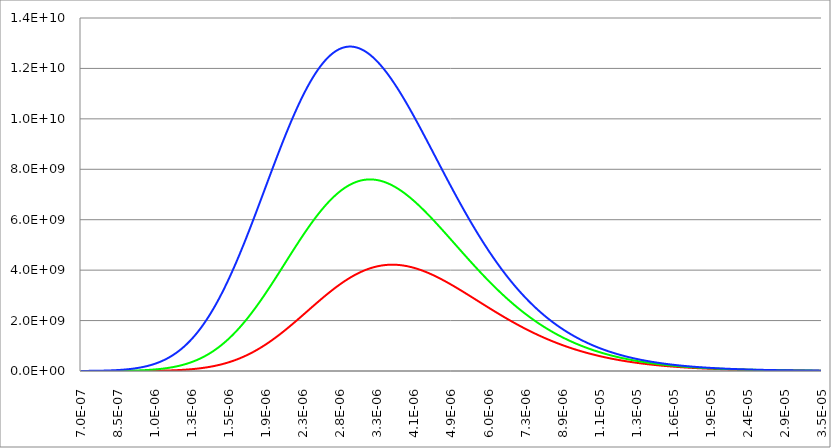
| Category | Series 1 | Series 0 | Series 2 |
|---|---|---|---|
| 7e-07 | 15470.366 | 268712.566 | 2637047.107 |
| 7.0137054801877e-07 | 16108.577 | 278241.494 | 2718401.957 |
| 7.02743779468786e-07 | 16771.471 | 288083.208 | 2802046.737 |
| 7.04119699604006e-07 | 17459.935 | 298247.075 | 2888039.017 |
| 7.05498313688677e-07 | 18174.883 | 308742.713 | 2976437.619 |
| 7.06879626997351e-07 | 18917.263 | 319579.997 | 3067302.632 |
| 7.08263644814909e-07 | 19688.049 | 330769.063 | 3160695.437 |
| 7.09650372436578e-07 | 20488.25 | 342320.314 | 3256678.73 |
| 7.11039815167953e-07 | 21318.908 | 354244.43 | 3355316.541 |
| 7.12431978325018e-07 | 22181.096 | 366552.37 | 3456674.26 |
| 7.13826867234164e-07 | 23075.925 | 379255.377 | 3560818.659 |
| 7.15224487232211e-07 | 24004.538 | 392364.991 | 3667817.914 |
| 7.16624843666428e-07 | 24968.118 | 405893.048 | 3777741.631 |
| 7.18027941894555e-07 | 25967.885 | 419851.694 | 3890660.867 |
| 7.1943378728482e-07 | 27005.096 | 434253.385 | 4006648.154 |
| 7.20842385215962e-07 | 28081.049 | 449110.897 | 4125777.527 |
| 7.22253741077253e-07 | 29197.084 | 464437.333 | 4248124.543 |
| 7.23667860268514e-07 | 30354.582 | 480246.131 | 4373766.309 |
| 7.25084748200141e-07 | 31554.967 | 496551.068 | 4502781.506 |
| 7.26504410293122e-07 | 32799.709 | 513366.272 | 4635250.416 |
| 7.27926851979058e-07 | 34090.324 | 530706.223 | 4771254.942 |
| 7.29352078700186e-07 | 35428.373 | 548585.77 | 4910878.641 |
| 7.30780095909398e-07 | 36815.467 | 567020.127 | 5054206.743 |
| 7.32210909070263e-07 | 38253.267 | 586024.891 | 5201326.181 |
| 7.33644523657047e-07 | 39743.484 | 605616.046 | 5352325.618 |
| 7.35080945154732e-07 | 41287.882 | 625809.968 | 5507295.468 |
| 7.36520179059044e-07 | 42888.279 | 646623.44 | 5666327.93 |
| 7.37962230876463e-07 | 44546.549 | 668073.654 | 5829517.011 |
| 7.39407106124256e-07 | 46264.621 | 690178.222 | 5996958.551 |
| 7.4085481033049e-07 | 48044.485 | 712955.187 | 6168750.256 |
| 7.42305349034054e-07 | 49888.189 | 736423.027 | 6344991.721 |
| 7.43758727784685e-07 | 51797.843 | 760600.668 | 6525784.46 |
| 7.45214952142983e-07 | 53775.621 | 785507.489 | 6711231.933 |
| 7.46674027680436e-07 | 55823.761 | 811163.336 | 6901439.576 |
| 7.48135959979443e-07 | 57944.568 | 837588.528 | 7096514.826 |
| 7.4960075463333e-07 | 60140.415 | 864803.866 | 7296567.153 |
| 7.51068417246375e-07 | 62413.746 | 892830.645 | 7501708.087 |
| 7.5253895343383e-07 | 64767.076 | 921690.661 | 7712051.249 |
| 7.54012368821939e-07 | 67202.993 | 951406.223 | 7927712.375 |
| 7.55488669047963e-07 | 69724.164 | 982000.162 | 8148809.354 |
| 7.56967859760202e-07 | 72333.329 | 1013495.841 | 8375462.249 |
| 7.58449946618013e-07 | 75033.312 | 1045917.167 | 8607793.332 |
| 7.59934935291832e-07 | 77827.016 | 1079288.597 | 8845927.112 |
| 7.61422831463202e-07 | 80717.429 | 1113635.154 | 9089990.366 |
| 7.62913640824785e-07 | 83707.624 | 1148982.433 | 9340112.167 |
| 7.64407369080393e-07 | 86800.761 | 1185356.616 | 9596423.919 |
| 7.65904021945003e-07 | 90000.094 | 1222784.478 | 9859059.381 |
| 7.67403605144781e-07 | 93308.966 | 1261293.403 | 10128154.705 |
| 7.68906124417108e-07 | 96730.815 | 1300911.393 | 10403848.46 |
| 7.70411585510594e-07 | 100269.177 | 1341667.08 | 10686281.669 |
| 7.71919994185107e-07 | 103927.688 | 1383589.734 | 10975597.836 |
| 7.73431356211793e-07 | 107710.085 | 1426709.282 | 11271942.978 |
| 7.74945677373094e-07 | 111620.21 | 1471056.313 | 11575465.659 |
| 7.76462963462777e-07 | 115662.011 | 1516662.092 | 11886317.017 |
| 7.77983220285953e-07 | 119839.546 | 1563558.574 | 12204650.8 |
| 7.79506453659095e-07 | 124156.986 | 1611778.416 | 12530623.396 |
| 7.81032669410068e-07 | 128618.616 | 1661354.985 | 12864393.864 |
| 7.82561873378147e-07 | 133228.838 | 1712322.377 | 13206123.966 |
| 7.84094071414038e-07 | 137992.175 | 1764715.424 | 13555978.201 |
| 7.85629269379904e-07 | 142913.274 | 1818569.711 | 13914123.835 |
| 7.87167473149385e-07 | 147996.908 | 1873921.588 | 14280730.935 |
| 7.88708688607621e-07 | 153247.977 | 1930808.18 | 14655972.399 |
| 7.90252921651276e-07 | 158671.515 | 1989267.405 | 15040023.989 |
| 7.91800178188557e-07 | 164272.692 | 2049337.984 | 15433064.365 |
| 7.9335046413924e-07 | 170056.813 | 2111059.457 | 15835275.116 |
| 7.94903785434693e-07 | 176029.328 | 2174472.194 | 16246840.793 |
| 7.96460148017893e-07 | 182195.83 | 2239617.411 | 16667948.939 |
| 7.98019557843459e-07 | 188562.06 | 2306537.184 | 17098790.127 |
| 7.99582020877662e-07 | 195133.911 | 2375274.462 | 17539557.987 |
| 8.0114754309846e-07 | 201917.43 | 2445873.08 | 17990449.24 |
| 8.02716130495512e-07 | 208918.823 | 2518377.779 | 18451663.734 |
| 8.04287789070206e-07 | 216144.456 | 2592834.213 | 18923404.47 |
| 8.0586252483568e-07 | 223600.864 | 2669288.97 | 19405877.643 |
| 8.07440343816843e-07 | 231294.749 | 2747789.584 | 19899292.664 |
| 8.09021252050405e-07 | 239232.983 | 2828384.548 | 20403862.203 |
| 8.10605255584892e-07 | 247422.621 | 2911123.335 | 20919802.214 |
| 8.12192360480673e-07 | 255870.892 | 2996056.407 | 21447331.97 |
| 8.13782572809984e-07 | 264585.214 | 3083235.234 | 21986674.097 |
| 8.15375898656947e-07 | 273573.191 | 3172712.309 | 22538054.602 |
| 8.16972344117601e-07 | 282842.62 | 3264541.163 | 23101702.909 |
| 8.18571915299916e-07 | 292401.495 | 3358776.381 | 23677851.89 |
| 8.20174618323824e-07 | 302258.01 | 3455473.618 | 24266737.895 |
| 8.21780459321238e-07 | 312420.566 | 3554689.616 | 24868600.786 |
| 8.23389444436076e-07 | 322897.769 | 3656482.218 | 25483683.97 |
| 8.25001579824288e-07 | 333698.445 | 3760910.385 | 26112234.426 |
| 8.26616871653875e-07 | 344831.632 | 3868034.216 | 26754502.741 |
| 8.28235326104914e-07 | 356306.595 | 3977914.958 | 27410743.139 |
| 8.29856949369584e-07 | 368132.826 | 4090615.03 | 28081213.514 |
| 8.31481747652186e-07 | 380320.046 | 4206198.032 | 28766175.457 |
| 8.33109727169169e-07 | 392878.216 | 4324728.769 | 29465894.293 |
| 8.34740894149155e-07 | 405817.538 | 4446273.265 | 30180639.105 |
| 8.3637525483296e-07 | 419148.46 | 4570898.778 | 30910682.77 |
| 8.38012815473616e-07 | 432881.682 | 4698673.82 | 31656301.985 |
| 8.39653582336404e-07 | 447028.16 | 4829668.177 | 32417777.302 |
| 8.41297561698868e-07 | 461599.112 | 4963952.918 | 33195393.152 |
| 8.42944759850844e-07 | 476606.024 | 5101600.422 | 33989437.877 |
| 8.44595183094481e-07 | 492060.653 | 5242684.39 | 34800203.761 |
| 8.46248837744272e-07 | 507975.034 | 5387279.864 | 35627987.057 |
| 8.47905730127068e-07 | 524361.485 | 5535463.246 | 36473088.015 |
| 8.4956586658211e-07 | 541232.612 | 5687312.315 | 37335810.914 |
| 8.51229253461052e-07 | 558601.317 | 5842906.244 | 38216464.086 |
| 8.52895897127981e-07 | 576480.799 | 6002325.621 | 39115359.946 |
| 8.54565803959447e-07 | 594884.565 | 6165652.464 | 40032815.019 |
| 8.56238980344484e-07 | 613826.431 | 6332970.243 | 40969149.967 |
| 8.57915432684634e-07 | 633320.534 | 6504363.894 | 41924689.617 |
| 8.59595167393975e-07 | 653381.329 | 6679919.842 | 42899762.987 |
| 8.61278190899141e-07 | 674023.606 | 6859726.015 | 43894703.308 |
| 8.62964509639351e-07 | 695262.486 | 7043871.867 | 44909848.057 |
| 8.6465413006643e-07 | 717113.434 | 7232448.394 | 45945538.978 |
| 8.66347058644837e-07 | 739592.261 | 7425548.152 | 47002122.106 |
| 8.68043301851684e-07 | 762715.135 | 7623265.279 | 48079947.794 |
| 8.6974286617677e-07 | 786498.584 | 7825695.511 | 49179370.734 |
| 8.71445758122596e-07 | 810959.501 | 8032936.203 | 50300749.985 |
| 8.73151984204397e-07 | 836115.156 | 8245086.345 | 51444448.992 |
| 8.74861550950164e-07 | 861983.198 | 8462246.586 | 52610835.61 |
| 8.76574464900668e-07 | 888581.664 | 8684519.245 | 53800282.127 |
| 8.78290732609489e-07 | 915928.985 | 8912008.341 | 55013165.285 |
| 8.80010360643035e-07 | 944043.994 | 9144819.601 | 56249866.301 |
| 8.81733355580574e-07 | 972945.932 | 9383060.488 | 57510770.885 |
| 8.83459724014252e-07 | 1002654.456 | 9626840.213 | 58796269.267 |
| 8.85189472549125e-07 | 1033189.643 | 9876269.761 | 60106756.209 |
| 8.8692260780318e-07 | 1064572.002 | 10131461.905 | 61442631.028 |
| 8.88659136407362e-07 | 1096822.481 | 10392531.227 | 62804297.613 |
| 8.90399065005598e-07 | 1129962.469 | 10659594.137 | 64192164.445 |
| 8.92142400254825e-07 | 1164013.808 | 10932768.893 | 65606644.61 |
| 8.93889148825011e-07 | 1198998.803 | 11212175.62 | 67048155.818 |
| 8.95639317399186e-07 | 1234940.223 | 11497936.327 | 68517120.42 |
| 8.97392912673464e-07 | 1271861.312 | 11790174.93 | 70013965.422 |
| 8.99149941357068e-07 | 1309785.8 | 12089017.269 | 71539122.499 |
| 9.0091041017236e-07 | 1348737.905 | 12394591.125 | 73093028.009 |
| 9.02674325854863e-07 | 1388742.346 | 12707026.244 | 74676123.007 |
| 9.04441695153284e-07 | 1429824.348 | 13026454.351 | 76288853.257 |
| 9.0621252482955e-07 | 1472009.65 | 13353009.175 | 77931669.246 |
| 9.07986821658821e-07 | 1515324.517 | 13686826.46 | 79605026.191 |
| 9.09764592429527e-07 | 1559795.744 | 14028043.991 | 81309384.052 |
| 9.11545843943387e-07 | 1605450.666 | 14376801.611 | 83045207.542 |
| 9.13330583015437e-07 | 1652317.166 | 14733241.236 | 84812966.133 |
| 9.15118816474057e-07 | 1700423.686 | 15097506.88 | 86613134.069 |
| 9.16910551160998e-07 | 1749799.233 | 15469744.668 | 88446190.367 |
| 9.18705793931403e-07 | 1800473.386 | 15850102.857 | 90312618.83 |
| 9.2050455165384e-07 | 1852476.31 | 16238731.857 | 92212908.047 |
| 9.22306831210322e-07 | 1905838.76 | 16635784.244 | 94147551.401 |
| 9.24112639496342e-07 | 1960592.093 | 17041414.782 | 96117047.072 |
| 9.25921983420888e-07 | 2016768.275 | 17455780.442 | 98121898.042 |
| 9.27734869906479e-07 | 2074399.891 | 17879040.415 | 100162612.093 |
| 9.29551305889186e-07 | 2133520.154 | 18311356.138 | 102239701.813 |
| 9.3137129831866e-07 | 2194162.914 | 18752891.302 | 104353684.593 |
| 9.3319485415816e-07 | 2256362.666 | 19203811.878 | 106505082.63 |
| 9.3502198038458e-07 | 2320154.564 | 19664286.132 | 108694422.921 |
| 9.3685268398847e-07 | 2385574.423 | 20134484.64 | 110922237.267 |
| 9.38686971974069e-07 | 2452658.735 | 20614580.307 | 113189062.263 |
| 9.40524851359333e-07 | 2521444.675 | 21104748.387 | 115495439.298 |
| 9.42366329175955e-07 | 2591970.112 | 21605166.494 | 117841914.55 |
| 9.44211412469395e-07 | 2664273.617 | 22116014.624 | 120229038.977 |
| 9.46060108298909e-07 | 2738394.476 | 22637475.168 | 122657368.315 |
| 9.47912423737576e-07 | 2814372.695 | 23169732.931 | 125127463.063 |
| 9.49768365872321e-07 | 2892249.013 | 23712975.147 | 127639888.48 |
| 9.51627941803946e-07 | 2972064.913 | 24267391.495 | 130195214.57 |
| 9.53491158647154e-07 | 3053862.628 | 24833174.115 | 132794016.077 |
| 9.55358023530582e-07 | 3137685.153 | 25410517.624 | 135436872.466 |
| 9.5722854359682e-07 | 3223576.258 | 25999619.129 | 138124367.913 |
| 9.59102726002443e-07 | 3311580.491 | 26600678.246 | 140857091.293 |
| 9.60980577918044e-07 | 3401743.195 | 27213897.113 | 143635636.158 |
| 9.62862106528247e-07 | 3494110.515 | 27839480.404 | 146460600.729 |
| 9.64747319031749e-07 | 3588729.408 | 28477635.343 | 149332587.87 |
| 9.6663622264134e-07 | 3685647.654 | 29128571.721 | 152252205.077 |
| 9.68528824583929e-07 | 3784913.866 | 29792501.906 | 155220064.451 |
| 9.7042513210058e-07 | 3886577.501 | 30469640.86 | 158236782.684 |
| 9.72325152446531e-07 | 3990688.869 | 31160206.152 | 161302981.029 |
| 9.74228892891225e-07 | 4097299.146 | 31864417.966 | 164419285.286 |
| 9.76136360718341e-07 | 4206460.379 | 32582499.122 | 167586325.77 |
| 9.78047563225816e-07 | 4318225.505 | 33314675.082 | 170804737.288 |
| 9.79962507725876e-07 | 4432648.352 | 34061173.964 | 174075159.114 |
| 9.81881201545066e-07 | 4549783.656 | 34822226.556 | 177398234.96 |
| 9.83803652024274e-07 | 4669687.071 | 35598066.322 | 180774612.945 |
| 9.85729866518761e-07 | 4792415.176 | 36388929.419 | 184204945.567 |
| 9.8765985239819e-07 | 4918025.489 | 37195054.706 | 187689889.671 |
| 9.89593617046652e-07 | 5046576.476 | 38016683.753 | 191230106.416 |
| 9.91531167862697e-07 | 5178127.561 | 38854060.851 | 194826261.241 |
| 9.93472512259359e-07 | 5312739.14 | 39707433.023 | 198479023.831 |
| 9.95417657664187e-07 | 5450472.587 | 40577050.034 | 202189068.078 |
| 9.97366611519274e-07 | 5591390.268 | 41463164.398 | 205957072.046 |
| 9.99319381281282e-07 | 5735555.55 | 42366031.388 | 209783717.932 |
| 1.00127597442147e-06 | 5883032.814 | 43285909.044 | 213669692.024 |
| 1.00323639842574e-06 | 6033887.46 | 44223058.178 | 217615684.66 |
| 1.00520066079463e-06 | 6188185.926 | 45177742.387 | 221622390.188 |
| 1.00716876904337e-06 | 6345995.691 | 46150228.054 | 225690506.918 |
| 1.00914073070191e-06 | 6507385.29 | 47140784.359 | 229820737.082 |
| 1.01111655331494e-06 | 6672424.324 | 48149683.282 | 234013786.782 |
| 1.01309624444193e-06 | 6841183.469 | 49177199.611 | 238270365.944 |
| 1.01507981165714e-06 | 7013734.489 | 50223610.944 | 242591188.273 |
| 1.01706726254965e-06 | 7190150.244 | 51289197.698 | 246976971.197 |
| 1.01905860472343e-06 | 7370504.701 | 52374243.11 | 251428435.819 |
| 1.02105384579731e-06 | 7554872.949 | 53479033.241 | 255946306.862 |
| 1.02305299340504e-06 | 7743331.201 | 54603856.981 | 260531312.616 |
| 1.02505605519534e-06 | 7935956.814 | 55749006.048 | 265184184.883 |
| 1.02706303883188e-06 | 8132828.291 | 56914774.998 | 269905658.919 |
| 1.02907395199334e-06 | 8334025.298 | 58101461.218 | 274696473.376 |
| 1.03108880237345e-06 | 8539628.669 | 59309364.931 | 279557370.242 |
| 1.03310759768097e-06 | 8749720.422 | 60538789.198 | 284489094.784 |
| 1.0351303456398e-06 | 8964383.763 | 61790039.917 | 289492395.481 |
| 1.03715705398892e-06 | 9183703.101 | 63063425.823 | 294568023.961 |
| 1.03918773048249e-06 | 9407764.056 | 64359258.486 | 299716734.943 |
| 1.04122238288984e-06 | 9636653.471 | 65677852.309 | 304939286.162 |
| 1.04326101899551e-06 | 9870459.418 | 67019524.531 | 310236438.307 |
| 1.04530364659929e-06 | 10109271.214 | 68384595.218 | 315608954.951 |
| 1.04735027351623e-06 | 10353179.424 | 69773387.264 | 321057602.483 |
| 1.0494009075767e-06 | 10602275.877 | 71186226.386 | 326583150.032 |
| 1.05145555662638e-06 | 10856653.673 | 72623441.119 | 332186369.401 |
| 1.05351422852632e-06 | 11116407.19 | 74085362.812 | 337868034.987 |
| 1.05557693115297e-06 | 11381632.101 | 75572325.625 | 343628923.71 |
| 1.05764367239818e-06 | 11652425.375 | 77084666.518 | 349469814.935 |
| 1.05971446016928e-06 | 11928885.293 | 78622725.247 | 355391490.395 |
| 1.06178930238906e-06 | 12211111.452 | 80186844.357 | 361394734.111 |
| 1.06386820699584e-06 | 12499204.78 | 81777369.174 | 367480332.312 |
| 1.06595118194345e-06 | 12793267.541 | 83394647.794 | 373649073.354 |
| 1.06803823520134e-06 | 13093403.343 | 85039031.079 | 379901747.635 |
| 1.07012937475452e-06 | 13399717.152 | 86710872.642 | 386239147.517 |
| 1.07222460860366e-06 | 13712315.295 | 88410528.838 | 392662067.231 |
| 1.07432394476508e-06 | 14031305.475 | 90138358.756 | 399171302.799 |
| 1.07642739127082e-06 | 14356796.772 | 91894724.201 | 405767651.942 |
| 1.07853495616862e-06 | 14688899.658 | 93679989.689 | 412451913.991 |
| 1.08064664752197e-06 | 15027726.002 | 95494522.427 | 419224889.796 |
| 1.08276247341019e-06 | 15373389.079 | 97338692.304 | 426087381.637 |
| 1.08488244192838e-06 | 15726003.578 | 99212871.874 | 433040193.13 |
| 1.0870065611875e-06 | 16085685.608 | 101117436.341 | 440084129.13 |
| 1.08913483931439e-06 | 16452552.711 | 103052763.545 | 447219995.64 |
| 1.09126728445182e-06 | 16826723.863 | 105019233.944 | 454448599.713 |
| 1.09340390475847e-06 | 17208319.487 | 107017230.595 | 461770749.351 |
| 1.09554470840901e-06 | 17597461.455 | 109047139.141 | 469187253.411 |
| 1.09768970359413e-06 | 17994273.099 | 111109347.786 | 476698921.504 |
| 1.09983889852054e-06 | 18398879.219 | 113204247.281 | 484306563.89 |
| 1.10199230141102e-06 | 18811406.085 | 115332230.9 | 492010991.38 |
| 1.10414992050445e-06 | 19231981.446 | 117493694.423 | 499813015.23 |
| 1.10631176405584e-06 | 19660734.539 | 119689036.11 | 507713447.036 |
| 1.10847784033636e-06 | 20097796.09 | 121918656.681 | 515713098.631 |
| 1.1106481576334e-06 | 20543298.324 | 124182959.296 | 523812781.975 |
| 1.11282272425053e-06 | 20997374.971 | 126482349.524 | 532013309.049 |
| 1.11500154850763e-06 | 21460161.268 | 128817235.324 | 540315491.744 |
| 1.11718463874082e-06 | 21931793.967 | 131188027.02 | 548720141.753 |
| 1.11937200330257e-06 | 22412411.342 | 133595137.271 | 557228070.458 |
| 1.1215636505617e-06 | 22902153.19 | 136038981.047 | 565840088.82 |
| 1.12375958890342e-06 | 23401160.839 | 138519975.601 | 574557007.262 |
| 1.12595982672934e-06 | 23909577.149 | 141038540.442 | 583379635.558 |
| 1.12816437245754e-06 | 24427546.521 | 143595097.303 | 592308782.716 |
| 1.13037323452257e-06 | 24955214.899 | 146190070.112 | 601345256.864 |
| 1.13258642137549e-06 | 25492729.772 | 148823884.965 | 610489865.128 |
| 1.13480394148392e-06 | 26040240.18 | 151496970.089 | 619743413.519 |
| 1.13702580333206e-06 | 26597896.718 | 154209755.814 | 629106706.81 |
| 1.1392520154207e-06 | 27165851.535 | 156962674.54 | 638580548.419 |
| 1.14148258626729e-06 | 27744258.344 | 159756160.701 | 648165740.286 |
| 1.14371752440596e-06 | 28333272.416 | 162590650.73 | 657863082.75 |
| 1.14595683838754e-06 | 28933050.591 | 165466583.029 | 667673374.43 |
| 1.14820053677961e-06 | 29543751.272 | 168384397.928 | 677597412.098 |
| 1.15044862816652e-06 | 30165534.436 | 171344537.65 | 687635990.557 |
| 1.15270112114942e-06 | 30798561.625 | 174347446.273 | 697789902.513 |
| 1.15495802434631e-06 | 31442995.957 | 177393569.692 | 708059938.451 |
| 1.15721934639207e-06 | 32099002.121 | 180483355.581 | 718446886.509 |
| 1.15948509593847e-06 | 32766746.38 | 183617253.351 | 728951532.347 |
| 1.16175528165423e-06 | 33446396.572 | 186795714.113 | 739574659.022 |
| 1.16402991222504e-06 | 34138122.108 | 190019190.631 | 750317046.858 |
| 1.1663089963536e-06 | 34842093.973 | 193288137.284 | 761179473.317 |
| 1.16859254275964e-06 | 35558484.728 | 196603010.024 | 772162712.864 |
| 1.17088056017997e-06 | 36287468.504 | 199964266.328 | 783267536.843 |
| 1.1731730573685e-06 | 37029221.008 | 203372365.157 | 794494713.342 |
| 1.17547004309628e-06 | 37783919.513 | 206827766.91 | 805845007.06 |
| 1.17777152615156e-06 | 38551742.866 | 210330933.378 | 817319179.173 |
| 1.18007751533974e-06 | 39332871.476 | 213882327.695 | 828917987.204 |
| 1.18238801948352e-06 | 40127487.322 | 217482414.296 | 840642184.889 |
| 1.18470304742284e-06 | 40935773.941 | 221131658.861 | 852492522.037 |
| 1.18702260801495e-06 | 41757916.43 | 224830528.272 | 864469744.403 |
| 1.18934671013445e-06 | 42594101.445 | 228579490.564 | 876574593.545 |
| 1.19167536267331e-06 | 43444517.191 | 232379014.867 | 888807806.694 |
| 1.19400857454093e-06 | 44309353.421 | 236229571.363 | 901170116.613 |
| 1.19634635466411e-06 | 45188801.435 | 240131631.23 | 913662251.464 |
| 1.19868871198718e-06 | 46083054.071 | 244085666.589 | 926284934.669 |
| 1.20103565547195e-06 | 46992305.699 | 248092150.451 | 939038884.772 |
| 1.20338719409778e-06 | 47916752.222 | 252151556.664 | 951924815.302 |
| 1.20574333686161e-06 | 48856591.062 | 256264359.857 | 964943434.637 |
| 1.20810409277802e-06 | 49812021.162 | 260431035.385 | 978095445.861 |
| 1.21046947087919e-06 | 50783242.974 | 264652059.27 | 991381546.629 |
| 1.21283948021505e-06 | 51770458.452 | 268927908.148 | 1004802429.026 |
| 1.21521412985318e-06 | 52773871.049 | 273259059.209 | 1018358779.43 |
| 1.21759342887897e-06 | 53793685.707 | 277645990.139 | 1032051278.372 |
| 1.21997738639557e-06 | 54830108.848 | 282089179.058 | 1045880600.396 |
| 1.22236601152395e-06 | 55883348.366 | 286589104.465 | 1059847413.919 |
| 1.22475931340296e-06 | 56953613.622 | 291146245.175 | 1073952381.093 |
| 1.22715730118933e-06 | 58041115.429 | 295761080.257 | 1088196157.666 |
| 1.2295599840577e-06 | 59146066.046 | 300434088.974 | 1102579392.838 |
| 1.23196737120072e-06 | 60268679.168 | 305165750.718 | 1117102729.126 |
| 1.23437947182899e-06 | 61409169.916 | 309956544.949 | 1131766802.223 |
| 1.23679629517117e-06 | 62567754.824 | 314806951.13 | 1146572240.857 |
| 1.23921785047398e-06 | 63744651.83 | 319717448.663 | 1161519666.652 |
| 1.24164414700226e-06 | 64940080.264 | 324688516.824 | 1176609693.991 |
| 1.24407519403896e-06 | 66154260.836 | 329720634.695 | 1191842929.872 |
| 1.24651100088523e-06 | 67387415.624 | 334814281.102 | 1207219973.772 |
| 1.24895157686043e-06 | 68639768.061 | 339969934.544 | 1222741417.507 |
| 1.25139693130215e-06 | 69911542.923 | 345188073.127 | 1238407845.096 |
| 1.25384707356628e-06 | 71202966.312 | 350469174.497 | 1254219832.618 |
| 1.25630201302702e-06 | 72514265.646 | 355813715.769 | 1270177948.074 |
| 1.25876175907693e-06 | 73845669.643 | 361222173.457 | 1286282751.253 |
| 1.26122632112694e-06 | 75197408.308 | 366695023.41 | 1302534793.592 |
| 1.26369570860642e-06 | 76569712.913 | 372232740.733 | 1318934618.039 |
| 1.26616993096322e-06 | 77962815.986 | 377835799.723 | 1335482758.913 |
| 1.26864899766366e-06 | 79376951.296 | 383504673.794 | 1352179741.774 |
| 1.27113291819261e-06 | 80812353.829 | 389239835.406 | 1369026083.28 |
| 1.2736217020535e-06 | 82269259.781 | 395041755.992 | 1386022291.057 |
| 1.27611535876838e-06 | 83747906.534 | 400910905.885 | 1403168863.559 |
| 1.27861389787792e-06 | 85248532.64 | 406847754.245 | 1420466289.939 |
| 1.28111732894151e-06 | 86771377.803 | 412852768.985 | 1437915049.91 |
| 1.28362566153721e-06 | 88316682.861 | 418926416.696 | 1455515613.612 |
| 1.28613890526187e-06 | 89884689.766 | 425069162.571 | 1473268441.484 |
| 1.28865706973111e-06 | 91475641.566 | 431281470.333 | 1491173984.126 |
| 1.29118016457939e-06 | 93089782.382 | 437563802.156 | 1509232682.17 |
| 1.29370819946002e-06 | 94727357.393 | 443916618.588 | 1527444966.15 |
| 1.29624118404522e-06 | 96388612.809 | 450340378.478 | 1545811256.37 |
| 1.29877912802613e-06 | 98073795.855 | 456835538.898 | 1564331962.778 |
| 1.3013220411129e-06 | 99783154.747 | 463402555.063 | 1583007484.832 |
| 1.30386993303466e-06 | 101516938.669 | 470041880.254 | 1601838211.378 |
| 1.30642281353959e-06 | 103275397.755 | 476753965.743 | 1620824520.519 |
| 1.30898069239498e-06 | 105058783.06 | 483539260.71 | 1639966779.491 |
| 1.31154357938723e-06 | 106867346.54 | 490398212.168 | 1659265344.538 |
| 1.31411148432188e-06 | 108701341.031 | 497331264.882 | 1678720560.787 |
| 1.31668441702371e-06 | 110561020.219 | 504338861.287 | 1698332762.126 |
| 1.31926238733671e-06 | 112446638.619 | 511421441.415 | 1718102271.078 |
| 1.32184540512414e-06 | 114358451.549 | 518579442.808 | 1738029398.687 |
| 1.32443348026859e-06 | 116296715.106 | 525813300.442 | 1758114444.391 |
| 1.32702662267199e-06 | 118261686.138 | 533123446.644 | 1778357695.905 |
| 1.32962484225564e-06 | 120253622.219 | 540510311.014 | 1798759429.105 |
| 1.3322281489603e-06 | 122272781.622 | 547974320.34 | 1819319907.909 |
| 1.33483655274617e-06 | 124319423.293 | 555515898.521 | 1840039384.162 |
| 1.33745006359295e-06 | 126393806.82 | 563135466.483 | 1860918097.522 |
| 1.3400686914999e-06 | 128496192.409 | 570833442.097 | 1881956275.345 |
| 1.34269244648583e-06 | 130626840.855 | 578610240.1 | 1903154132.575 |
| 1.34532133858918e-06 | 132786013.51 | 586466272.012 | 1924511871.632 |
| 1.34795537786806e-06 | 134973972.257 | 594401946.051 | 1946029682.303 |
| 1.35059457440024e-06 | 137190979.48 | 602417667.055 | 1967707741.633 |
| 1.35323893828325e-06 | 139437298.034 | 610513836.399 | 1989546213.818 |
| 1.35588847963438e-06 | 141713191.213 | 618690851.91 | 2011545250.103 |
| 1.35854320859071e-06 | 144018922.719 | 626949107.787 | 2033704988.671 |
| 1.36120313530921e-06 | 146354756.636 | 635288994.519 | 2056025554.548 |
| 1.3638682699667e-06 | 148720957.391 | 643710898.8 | 2078507059.497 |
| 1.36653862275994e-06 | 151117789.726 | 652215203.45 | 2101149601.919 |
| 1.36921420390565e-06 | 153545518.667 | 660802287.328 | 2123953266.754 |
| 1.37189502364056e-06 | 156004409.488 | 669472525.254 | 2146918125.389 |
| 1.37458109222143e-06 | 158494727.678 | 678226287.925 | 2170044235.556 |
| 1.37727241992512e-06 | 161016738.912 | 687063941.831 | 2193331641.242 |
| 1.3799690170486e-06 | 163570709.01 | 695985849.174 | 2216780372.599 |
| 1.382670893909e-06 | 166156903.91 | 704992367.786 | 2240390445.847 |
| 1.38537806084365e-06 | 168775589.627 | 714083851.046 | 2264161863.194 |
| 1.38809052821014e-06 | 171427032.223 | 723260647.8 | 2288094612.742 |
| 1.3908083063863e-06 | 174111497.768 | 732523102.275 | 2312188668.402 |
| 1.39353140577031e-06 | 176829252.306 | 741871554.001 | 2336443989.816 |
| 1.3962598367807e-06 | 179580561.819 | 751306337.729 | 2360860522.269 |
| 1.3989936098564e-06 | 182365692.192 | 760827783.345 | 2385438196.61 |
| 1.40173273545677e-06 | 185184909.171 | 770436215.797 | 2410176929.177 |
| 1.40447722406166e-06 | 188038478.333 | 780131955.005 | 2435076621.716 |
| 1.40722708617144e-06 | 190926665.042 | 789915315.787 | 2460137161.308 |
| 1.40998233230703e-06 | 193849734.415 | 799786607.775 | 2485358420.297 |
| 1.41274297300995e-06 | 196807951.286 | 809746135.336 | 2510740256.217 |
| 1.41550901884237e-06 | 199801580.161 | 819794197.49 | 2536282511.724 |
| 1.41828048038712e-06 | 202830885.184 | 829931087.834 | 2561985014.527 |
| 1.42105736824777e-06 | 205896130.099 | 840157094.458 | 2587847577.327 |
| 1.42383969304864e-06 | 208997578.206 | 850472499.87 | 2613869997.746 |
| 1.42662746543486e-06 | 212135492.325 | 860877580.914 | 2640052058.272 |
| 1.4294206960724e-06 | 215310134.757 | 871372608.695 | 2666393526.196 |
| 1.4322193956481e-06 | 218521767.239 | 881957848.497 | 2692894153.558 |
| 1.43502357486975e-06 | 221770650.908 | 892633559.708 | 2719553677.085 |
| 1.43783324446607e-06 | 225057046.259 | 903399995.744 | 2746371818.144 |
| 1.44064841518682e-06 | 228381213.103 | 914257403.969 | 2773348282.686 |
| 1.44346909780279e-06 | 231743410.526 | 925206025.62 | 2800482761.2 |
| 1.44629530310586e-06 | 235143896.849 | 936246095.732 | 2827774928.664 |
| 1.44912704190904e-06 | 238582929.585 | 947377843.062 | 2855224444.496 |
| 1.45196432504652e-06 | 242060765.397 | 958601490.015 | 2882830952.519 |
| 1.45480716337369e-06 | 245577660.054 | 969917252.567 | 2910594080.912 |
| 1.4576555677672e-06 | 249133868.393 | 981325340.196 | 2938513442.176 |
| 1.46050954912499e-06 | 252729644.272 | 992825955.802 | 2966588633.094 |
| 1.46336911836634e-06 | 256365240.53 | 1004419295.642 | 2994819234.7 |
| 1.46623428643193e-06 | 260040908.94 | 1016105549.252 | 3023204812.241 |
| 1.46910506428381e-06 | 263756900.171 | 1027884899.377 | 3051744915.152 |
| 1.47198146290556e-06 | 267513463.741 | 1039757521.904 | 3080439077.027 |
| 1.4748634933022e-06 | 271310847.973 | 1051723585.785 | 3109286815.59 |
| 1.47775116650035e-06 | 275149299.953 | 1063783252.972 | 3138287632.674 |
| 1.48064449354818e-06 | 279029065.484 | 1075936678.349 | 3167441014.198 |
| 1.48354348551552e-06 | 282950389.045 | 1088184009.659 | 3196746430.15 |
| 1.48644815349385e-06 | 286913513.741 | 1100525387.44 | 3226203334.567 |
| 1.48935850859639e-06 | 290918681.266 | 1112960944.96 | 3255811165.523 |
| 1.4922745619581e-06 | 294966131.852 | 1125490808.144 | 3285569345.116 |
| 1.49519632473574e-06 | 299056104.225 | 1138115095.517 | 3315477279.455 |
| 1.49812380810794e-06 | 303188835.564 | 1150833918.134 | 3345534358.657 |
| 1.50105702327519e-06 | 307364561.453 | 1163647379.517 | 3375739956.837 |
| 1.50399598145992e-06 | 311583515.836 | 1176555575.594 | 3406093432.106 |
| 1.50694069390654e-06 | 315845930.971 | 1189558594.634 | 3436594126.573 |
| 1.50989117188145e-06 | 320152037.389 | 1202656517.19 | 3467241366.342 |
| 1.51284742667314e-06 | 324502063.84 | 1215849416.032 | 3498034461.517 |
| 1.51580946959218e-06 | 328896237.259 | 1229137356.095 | 3528972706.209 |
| 1.5187773119713e-06 | 333334782.709 | 1242520394.412 | 3560055378.543 |
| 1.5217509651654e-06 | 337817923.345 | 1255998580.064 | 3591281740.671 |
| 1.52473044055165e-06 | 342345880.36 | 1269571954.117 | 3622651038.781 |
| 1.52771574952944e-06 | 346918872.947 | 1283240549.57 | 3654162503.115 |
| 1.53070690352053e-06 | 351537118.246 | 1297004391.296 | 3685815347.986 |
| 1.53370391396901e-06 | 356200831.305 | 1310863495.993 | 3717608771.799 |
| 1.5367067923414e-06 | 360910225.028 | 1324817872.123 | 3749541957.071 |
| 1.53971555012665e-06 | 365665510.136 | 1338867519.869 | 3781614070.456 |
| 1.54273019883622e-06 | 370466895.113 | 1353012431.076 | 3813824262.775 |
| 1.54575075000409e-06 | 375314586.169 | 1367252589.205 | 3846171669.042 |
| 1.54877721518685e-06 | 380208787.186 | 1381587969.283 | 3878655408.496 |
| 1.55180960596369e-06 | 385149699.68 | 1396018537.853 | 3911274584.638 |
| 1.5548479339365e-06 | 390137522.749 | 1410544252.927 | 3944028285.262 |
| 1.55789221072985e-06 | 395172453.031 | 1425165063.944 | 3976915582.5 |
| 1.5609424479911e-06 | 400254684.657 | 1439880911.717 | 4009935532.857 |
| 1.5639986573904e-06 | 405384409.206 | 1454691728.399 | 4043087177.259 |
| 1.56706085062075e-06 | 410561815.661 | 1469597437.43 | 4076369541.097 |
| 1.57012903939805e-06 | 415787090.359 | 1484597953.502 | 4109781634.274 |
| 1.57320323546114e-06 | 421060416.952 | 1499693182.516 | 4143322451.256 |
| 1.57628345057183e-06 | 426381976.358 | 1514883021.541 | 4176990971.126 |
| 1.57936969651497e-06 | 431751946.716 | 1530167358.778 | 4210786157.637 |
| 1.58246198509849e-06 | 437170503.343 | 1545546073.522 | 4244706959.272 |
| 1.58556032815343e-06 | 442637818.688 | 1561019036.123 | 4278752309.298 |
| 1.58866473753399e-06 | 448154062.287 | 1576586107.956 | 4312921125.836 |
| 1.59177522511759e-06 | 453719400.72 | 1592247141.383 | 4347212311.918 |
| 1.59489180280489e-06 | 459333997.565 | 1608001979.722 | 4381624755.557 |
| 1.59801448251987e-06 | 464998013.357 | 1623850457.215 | 4416157329.816 |
| 1.60114327620985e-06 | 470711605.538 | 1639792398.999 | 4450808892.878 |
| 1.60427819584553e-06 | 476474928.421 | 1655827621.074 | 4485578288.117 |
| 1.60741925342107e-06 | 482288133.141 | 1671955930.28 | 4520464344.178 |
| 1.61056646095408e-06 | 488151367.612 | 1688177124.265 | 4555465875.053 |
| 1.61371983048573e-06 | 494064776.488 | 1704490991.463 | 4590581680.159 |
| 1.61687937408077e-06 | 500028501.113 | 1720897311.069 | 4625810544.424 |
| 1.62004510382753e-06 | 506042679.488 | 1737395853.018 | 4661151238.366 |
| 1.62321703183806e-06 | 512107446.218 | 1753986377.959 | 4696602518.186 |
| 1.62639517024809e-06 | 518222932.479 | 1770668637.239 | 4732163125.852 |
| 1.62957953121712e-06 | 524389265.97 | 1787442372.881 | 4767831789.192 |
| 1.63277012692846e-06 | 530606570.875 | 1804307317.57 | 4803607221.986 |
| 1.63596696958928e-06 | 536874967.819 | 1821263194.632 | 4839488124.063 |
| 1.63917007143063e-06 | 543194573.828 | 1838309718.022 | 4875473181.397 |
| 1.64237944470752e-06 | 549565502.291 | 1855446592.309 | 4911561066.206 |
| 1.64559510169897e-06 | 555987862.914 | 1872673512.665 | 4947750437.056 |
| 1.64881705470801e-06 | 562461761.686 | 1889990164.851 | 4984039938.963 |
| 1.65204531606179e-06 | 568987300.835 | 1907396225.209 | 5020428203.497 |
| 1.65527989811157e-06 | 575564578.789 | 1924891360.655 | 5056913848.895 |
| 1.65852081323281e-06 | 582193690.14 | 1942475228.668 | 5093495480.166 |
| 1.66176807382519e-06 | 588874725.602 | 1960147477.287 | 5130171689.203 |
| 1.66502169231268e-06 | 595607771.974 | 1977907745.107 | 5166941054.901 |
| 1.66828168114355e-06 | 602392912.101 | 1995755661.272 | 5203802143.271 |
| 1.67154805279046e-06 | 609230224.841 | 2013690845.478 | 5240753507.554 |
| 1.67482081975051e-06 | 616119785.019 | 2031712907.971 | 5277793688.347 |
| 1.67809999454523e-06 | 623061663.399 | 2049821449.546 | 5314921213.722 |
| 1.68138558972069e-06 | 630055926.644 | 2068016061.551 | 5352134599.346 |
| 1.68467761784752e-06 | 637102637.278 | 2086296325.89 | 5389432348.615 |
| 1.68797609152096e-06 | 644201853.657 | 2104661815.031 | 5426812952.773 |
| 1.69128102336091e-06 | 651353629.924 | 2123112092.007 | 5464274891.047 |
| 1.69459242601198e-06 | 658558015.985 | 2141646710.428 | 5501816630.775 |
| 1.69791031214355e-06 | 665815057.466 | 2160265214.49 | 5539436627.541 |
| 1.70123469444977e-06 | 673124795.688 | 2178967138.983 | 5577133325.306 |
| 1.70456558564969e-06 | 680487267.623 | 2197752009.305 | 5614905156.552 |
| 1.70790299848723e-06 | 687902505.873 | 2216619341.475 | 5652750542.412 |
| 1.71124694573127e-06 | 695370538.629 | 2235568642.148 | 5690667892.815 |
| 1.7145974401757e-06 | 702891389.642 | 2254599408.631 | 5728655606.626 |
| 1.71795449463944e-06 | 710465078.193 | 2273711128.899 | 5766712071.789 |
| 1.72131812196654e-06 | 718091619.063 | 2292903281.615 | 5804835665.475 |
| 1.72468833502616e-06 | 725771022.498 | 2312175336.152 | 5843024754.224 |
| 1.72806514671268e-06 | 733503294.185 | 2331526752.612 | 5881277694.099 |
| 1.73144856994573e-06 | 741288435.219 | 2350956981.851 | 5919592830.829 |
| 1.73483861767022e-06 | 749126442.076 | 2370465465.5 | 5957968499.968 |
| 1.73823530285641e-06 | 757017306.586 | 2390051635.996 | 5996403027.041 |
| 1.74163863849996e-06 | 764961015.902 | 2409714916.605 | 6034894727.705 |
| 1.74504863762198e-06 | 772957552.477 | 2429454721.452 | 6073441907.899 |
| 1.74846531326905e-06 | 781006894.035 | 2449270455.552 | 6112042864.006 |
| 1.75188867851332e-06 | 789109013.548 | 2469161514.839 | 6150695883.01 |
| 1.75531874645252e-06 | 797263879.208 | 2489127286.199 | 6189399242.657 |
| 1.75875553021004e-06 | 805471454.403 | 2509167147.508 | 6228151211.616 |
| 1.76219904293494e-06 | 813731697.694 | 2529280467.66 | 6266950049.642 |
| 1.76564929780205e-06 | 822044562.791 | 2549466606.612 | 6305794007.744 |
| 1.76910630801197e-06 | 830409998.532 | 2569724915.414 | 6344681328.343 |
| 1.77257008679117e-06 | 838827948.856 | 2590054736.256 | 6383610245.447 |
| 1.776040647392e-06 | 847298352.789 | 2610455402.504 | 6422578984.816 |
| 1.77951800309277e-06 | 855821144.415 | 2630926238.742 | 6461585764.131 |
| 1.78300216719778e-06 | 864396252.862 | 2651466560.818 | 6500628793.164 |
| 1.78649315303738e-06 | 873023602.28 | 2672075675.887 | 6539706273.954 |
| 1.78999097396801e-06 | 881703111.822 | 2692752882.459 | 6578816400.976 |
| 1.79349564337228e-06 | 890434695.626 | 2713497470.444 | 6617957361.315 |
| 1.79700717465899e-06 | 899218262.796 | 2734308721.2 | 6657127334.844 |
| 1.80052558126319e-06 | 908053717.388 | 2755185907.588 | 6696324494.4 |
| 1.80405087664626e-06 | 916940958.392 | 2776128294.019 | 6735547005.959 |
| 1.8075830742959e-06 | 925879879.717 | 2797135136.506 | 6774793028.816 |
| 1.81112218772624e-06 | 934870370.173 | 2818205682.722 | 6814060715.763 |
| 1.81466823047787e-06 | 943912313.463 | 2839339172.05 | 6853348213.271 |
| 1.81822121611788e-06 | 953005588.163 | 2860534835.646 | 6892653661.672 |
| 1.82178115823993e-06 | 962150067.714 | 2881791896.488 | 6931975195.336 |
| 1.8253480704643e-06 | 971345620.406 | 2903109569.445 | 6971310942.86 |
| 1.82892196643793e-06 | 980592109.371 | 2924487061.327 | 7010659027.248 |
| 1.83250285983449e-06 | 989889392.569 | 2945923570.955 | 7050017566.097 |
| 1.8360907643544e-06 | 999237322.776 | 2967418289.219 | 7089384671.78 |
| 1.83968569372492e-06 | 1008635747.582 | 2988970399.141 | 7128758451.638 |
| 1.8432876617002e-06 | 1018084509.375 | 3010579075.945 | 7168137008.158 |
| 1.8468966820613e-06 | 1027583445.337 | 3032243487.116 | 7207518439.168 |
| 1.85051276861626e-06 | 1037132387.438 | 3053962792.477 | 7246900838.02 |
| 1.85413593520017e-06 | 1046731162.423 | 3075736144.247 | 7286282293.783 |
| 1.8577661956752e-06 | 1056379591.817 | 3097562687.118 | 7325660891.429 |
| 1.86140356393066e-06 | 1066077491.909 | 3119441558.324 | 7365034712.022 |
| 1.86504805388305e-06 | 1075824673.757 | 3141371887.714 | 7404401832.912 |
| 1.86869967947614e-06 | 1085620943.179 | 3163352797.82 | 7443760327.924 |
| 1.87235845468097e-06 | 1095466100.752 | 3185383403.941 | 7483108267.548 |
| 1.87602439349596e-06 | 1105359941.81 | 3207462814.207 | 7522443719.133 |
| 1.87969750994692e-06 | 1115302256.444 | 3229590129.665 | 7561764747.078 |
| 1.88337781808713e-06 | 1125292829.499 | 3251764444.351 | 7601069413.022 |
| 1.88706533199738e-06 | 1135331440.578 | 3273984845.373 | 7640355776.043 |
| 1.89076006578603e-06 | 1145417864.04 | 3296250412.986 | 7679621892.845 |
| 1.89446203358908e-06 | 1155551869.003 | 3318560220.674 | 7718865817.955 |
| 1.89817124957018e-06 | 1165733219.347 | 3340913335.235 | 7758085603.914 |
| 1.90188772792073e-06 | 1175961673.716 | 3363308816.861 | 7797279301.474 |
| 1.90561148285991e-06 | 1186236985.526 | 3385745719.223 | 7836444959.788 |
| 1.90934252863474e-06 | 1196558902.963 | 3408223089.553 | 7875580626.611 |
| 1.91308087952013e-06 | 1206927168.996 | 3430739968.734 | 7914684348.486 |
| 1.91682654981895e-06 | 1217341521.381 | 3453295391.385 | 7953754170.943 |
| 1.92057955386207e-06 | 1227801692.664 | 3475888385.947 | 7992788138.693 |
| 1.92433990600841e-06 | 1238307410.196 | 3498517974.774 | 8031784295.825 |
| 1.92810762064501e-06 | 1248858396.136 | 3521183174.221 | 8070740685.995 |
| 1.93188271218708e-06 | 1259454367.465 | 3543882994.737 | 8109655352.624 |
| 1.93566519507806e-06 | 1270095035.993 | 3566616440.952 | 8148526339.092 |
| 1.93945508378966e-06 | 1280780108.372 | 3589382511.775 | 8187351688.933 |
| 1.94325239282192e-06 | 1291509286.106 | 3612180200.48 | 8226129446.028 |
| 1.94705713670328e-06 | 1302282265.565 | 3635008494.808 | 8264857654.799 |
| 1.95086932999062e-06 | 1313098738 | 3657866377.055 | 8303534360.406 |
| 1.95468898726934e-06 | 1323958389.554 | 3680752824.172 | 8342157608.936 |
| 1.95851612315336e-06 | 1334860901.276 | 3703666807.857 | 8380725447.598 |
| 1.96235075228524e-06 | 1345805949.144 | 3726607294.658 | 8419235924.92 |
| 1.96619288933621e-06 | 1356793204.071 | 3749573246.068 | 8457687090.937 |
| 1.97004254900621e-06 | 1367822331.932 | 3772563618.62 | 8496076997.385 |
| 1.97389974602397e-06 | 1378892993.573 | 3795577363.995 | 8534403697.895 |
| 1.97776449514706e-06 | 1390004844.839 | 3818613429.114 | 8572665248.185 |
| 1.98163681116194e-06 | 1401157536.584 | 3841670756.244 | 8610859706.246 |
| 1.98551670888403e-06 | 1412350714.7 | 3864748283.096 | 8648985132.541 |
| 1.98940420315774e-06 | 1423584020.131 | 3887844942.931 | 8687039590.19 |
| 1.99329930885656e-06 | 1434857088.898 | 3910959664.661 | 8725021145.162 |
| 1.99720204088309e-06 | 1446169552.123 | 3934091372.952 | 8762927866.464 |
| 2.00111241416911e-06 | 1457521036.047 | 3957238988.328 | 8800757826.332 |
| 2.00503044367565e-06 | 1468911162.061 | 3980401427.277 | 8838509100.415 |
| 2.00895614439301e-06 | 1480339546.723 | 4003577602.358 | 8876179767.969 |
| 2.01288953134086e-06 | 1491805801.79 | 4026766422.303 | 8913767912.036 |
| 2.01683061956826e-06 | 1503309534.24 | 4049966792.125 | 8951271619.639 |
| 2.02077942415376e-06 | 1514850346.302 | 4073177613.227 | 8988688981.963 |
| 2.02473596020539e-06 | 1526427835.479 | 4096397783.507 | 9026018094.541 |
| 2.02870024286081e-06 | 1538041594.583 | 4119626197.467 | 9063257057.437 |
| 2.03267228728729e-06 | 1549691211.758 | 4142861746.324 | 9100403975.434 |
| 2.03665210868179e-06 | 1561376270.511 | 4166103318.114 | 9137456958.212 |
| 2.04063972227104e-06 | 1573096349.746 | 4189349797.804 | 9174414120.532 |
| 2.04463514331159e-06 | 1584851023.791 | 4212600067.405 | 9211273582.416 |
| 2.04863838708984e-06 | 1596639862.432 | 4235853006.076 | 9248033469.33 |
| 2.05264946892213e-06 | 1608462430.946 | 4259107490.241 | 9284691912.361 |
| 2.05666840415479e-06 | 1620318290.131 | 4282362393.695 | 9321247048.396 |
| 2.06069520816419e-06 | 1632206996.344 | 4305616587.718 | 9357697020.298 |
| 2.06472989635682e-06 | 1644128101.534 | 4328868941.189 | 9394039977.088 |
| 2.06877248416932e-06 | 1656081153.276 | 4352118320.692 | 9430274074.112 |
| 2.07282298706855e-06 | 1668065694.809 | 4375363590.633 | 9466397473.223 |
| 2.07688142055168e-06 | 1680081265.072 | 4398603613.354 | 9502408342.951 |
| 2.08094780014619e-06 | 1692127398.738 | 4421837249.24 | 9538304858.675 |
| 2.08502214140998e-06 | 1704203626.26 | 4445063356.838 | 9574085202.796 |
| 2.08910445993141e-06 | 1716309473.899 | 4468280792.97 | 9609747564.906 |
| 2.09319477132936e-06 | 1728444463.774 | 4491488412.841 | 9645290141.96 |
| 2.09729309125328e-06 | 1740608113.891 | 4514685070.161 | 9680711138.437 |
| 2.10139943538328e-06 | 1752799938.194 | 4537869617.252 | 9716008766.515 |
| 2.10551381943015e-06 | 1765019446.598 | 4561040905.166 | 9751181246.231 |
| 2.10963625913546e-06 | 1777266145.035 | 4584197783.801 | 9786226805.648 |
| 2.11376677027158e-06 | 1789539535.494 | 4607339102.009 | 9821143681.016 |
| 2.11790536864178e-06 | 1801839116.068 | 4630463707.718 | 9855930116.935 |
| 2.12205207008026e-06 | 1814164380.99 | 4653570448.041 | 9890584366.515 |
| 2.12620689045222e-06 | 1826514820.686 | 4676658169.396 | 9925104691.539 |
| 2.13036984565394e-06 | 1838889921.813 | 4699725717.616 | 9959489362.612 |
| 2.13454095161282e-06 | 1851289167.308 | 4722771938.065 | 9993736659.327 |
| 2.13872022428741e-06 | 1863712036.43 | 4745795675.757 | 10027844870.415 |
| 2.14290767966756e-06 | 1876158004.813 | 4768795775.463 | 10061812293.899 |
| 2.14710333377438e-06 | 1888626544.505 | 4791771081.835 | 10095637237.25 |
| 2.15130720266038e-06 | 1901117124.02 | 4814720439.512 | 10129318017.532 |
| 2.15551930240948e-06 | 1913629208.389 | 4837642693.243 | 10162852961.556 |
| 2.15973964913711e-06 | 1926162259.199 | 4860536687.996 | 10196240406.029 |
| 2.16396825899023e-06 | 1938715734.653 | 4883401269.072 | 10229478697.695 |
| 2.16820514814743e-06 | 1951289089.613 | 4906235282.226 | 10262566193.486 |
| 2.17245033281898e-06 | 1963881775.65 | 4929037573.774 | 10295501260.661 |
| 2.17670382924687e-06 | 1976493241.099 | 4951806990.712 | 10328282276.954 |
| 2.1809656537049e-06 | 1989122931.105 | 4974542380.828 | 10360907630.706 |
| 2.18523582249875e-06 | 2001770287.679 | 4997242592.817 | 10393375721.012 |
| 2.18951435196599e-06 | 2014434749.747 | 5019906476.392 | 10425684957.854 |
| 2.19380125847622e-06 | 2027115753.204 | 5042532882.402 | 10457833762.237 |
| 2.19809655843105e-06 | 2039812730.965 | 5065120662.941 | 10489820566.326 |
| 2.20240026826422e-06 | 2052525113.022 | 5087668671.465 | 10521643813.574 |
| 2.20671240444166e-06 | 2065252326.494 | 5110175762.901 | 10553301958.858 |
| 2.21103298346153e-06 | 2077993795.685 | 5132640793.762 | 10584793468.605 |
| 2.21536202185427e-06 | 2090748942.135 | 5155062622.256 | 10616116820.92 |
| 2.21969953618271e-06 | 2103517184.677 | 5177440108.404 | 10647270505.713 |
| 2.22404554304212e-06 | 2116297939.493 | 5199772114.144 | 10678253024.823 |
| 2.22840005906022e-06 | 2129090620.169 | 5222057503.45 | 10709062892.139 |
| 2.23276310089732e-06 | 2141894637.752 | 5244295142.434 | 10739698633.724 |
| 2.23713468524635e-06 | 2154709400.806 | 5266483899.465 | 10770158787.932 |
| 2.2415148288329e-06 | 2167534315.469 | 5288622645.273 | 10800441905.524 |
| 2.24590354841533e-06 | 2180368785.51 | 5310710253.063 | 10830546549.788 |
| 2.2503008607848e-06 | 2193212212.39 | 5332745598.621 | 10860471296.648 |
| 2.25470678276536e-06 | 2206063995.314 | 5354727560.424 | 10890214734.781 |
| 2.25912133121397e-06 | 2218923531.295 | 5376655019.75 | 10919775465.723 |
| 2.26354452302062e-06 | 2231790215.211 | 5398526860.78 | 10949152103.98 |
| 2.26797637510837e-06 | 2244663439.864 | 5420341970.716 | 10978343277.133 |
| 2.2724169044334e-06 | 2257542596.035 | 5442099239.875 | 11007347625.948 |
| 2.2768661279851e-06 | 2270427072.554 | 5463797561.807 | 11036163804.472 |
| 2.28132406278613e-06 | 2283316256.348 | 5485435833.393 | 11064790480.139 |
| 2.28579072589245e-06 | 2296209532.51 | 5507012954.955 | 11093226333.868 |
| 2.29026613439344e-06 | 2309106284.354 | 5528527830.356 | 11121470060.161 |
| 2.29475030541194e-06 | 2322005893.481 | 5549979367.109 | 11149520367.2 |
| 2.29924325610431e-06 | 2334907739.833 | 5571366476.478 | 11177375976.94 |
| 2.30374500366048e-06 | 2347811201.762 | 5592688073.582 | 11205035625.198 |
| 2.30825556530408e-06 | 2360715656.083 | 5613943077.496 | 11232498061.749 |
| 2.31277495829243e-06 | 2373620478.143 | 5635130411.353 | 11259762050.413 |
| 2.31730319991664e-06 | 2386525041.88 | 5656249002.449 | 11286826369.137 |
| 2.3218403075017e-06 | 2399428719.883 | 5677297782.335 | 11313689810.084 |
| 2.32638629840648e-06 | 2412330883.456 | 5698275686.925 | 11340351179.717 |
| 2.33094119002387e-06 | 2425230902.683 | 5719181656.591 | 11366809298.874 |
| 2.33550499978081e-06 | 2438128146.484 | 5740014636.262 | 11393063002.852 |
| 2.34007774513835e-06 | 2451021982.684 | 5760773575.523 | 11419111141.485 |
| 2.34465944359174e-06 | 2463911778.074 | 5781457428.709 | 11444952579.214 |
| 2.34925011267046e-06 | 2476796898.47 | 5802065155.004 | 11470586195.163 |
| 2.35384976993834e-06 | 2489676708.783 | 5822595718.535 | 11496010883.212 |
| 2.35845843299359e-06 | 2502550573.075 | 5843048088.466 | 11521225552.064 |
| 2.36307611946886e-06 | 2515417854.629 | 5863421239.096 | 11546229125.316 |
| 2.36770284703135e-06 | 2528277916.006 | 5883714149.946 | 11571020541.518 |
| 2.37233863338283e-06 | 2541130119.115 | 5903925805.856 | 11595598754.243 |
| 2.37698349625974e-06 | 2553973825.27 | 5924055197.073 | 11619962732.148 |
| 2.38163745343323e-06 | 2566808395.259 | 5944101319.347 | 11644111459.031 |
| 2.38630052270928e-06 | 2579633189.403 | 5964063174.014 | 11668043933.891 |
| 2.3909727219287e-06 | 2592447567.624 | 5983939768.09 | 11691759170.984 |
| 2.39565406896723e-06 | 2605250889.506 | 6003730114.358 | 11715256199.876 |
| 2.40034458173563e-06 | 2618042514.359 | 6023433231.454 | 11738534065.496 |
| 2.40504427817972e-06 | 2630821801.285 | 6043048143.956 | 11761591828.188 |
| 2.40975317628046e-06 | 2643588109.236 | 6062573882.466 | 11784428563.756 |
| 2.414471294054e-06 | 2656340797.087 | 6082009483.698 | 11807043363.513 |
| 2.41919864955177e-06 | 2669079223.689 | 6101353990.559 | 11829435334.323 |
| 2.42393526086057e-06 | 2681802747.942 | 6120606452.235 | 11851603598.649 |
| 2.42868114610257e-06 | 2694510728.854 | 6139765924.271 | 11873547294.586 |
| 2.43343632343545e-06 | 2707202525.603 | 6158831468.65 | 11895265575.908 |
| 2.43820081105243e-06 | 2719877497.606 | 6177802153.877 | 11916757612.097 |
| 2.44297462718236e-06 | 2732535004.577 | 6196677055.057 | 11938022588.386 |
| 2.44775779008978e-06 | 2745174406.595 | 6215455253.971 | 11959059705.784 |
| 2.45255031807498e-06 | 2757795064.163 | 6234135839.156 | 11979868181.115 |
| 2.45735222947408e-06 | 2770396338.274 | 6252717905.978 | 12000447247.041 |
| 2.46216354265912e-06 | 2782977590.474 | 6271200556.71 | 12020796152.094 |
| 2.4669842760381e-06 | 2795538182.925 | 6289582900.607 | 12040914160.699 |
| 2.47181444805504e-06 | 2808077478.465 | 6307864053.976 | 12060800553.198 |
| 2.47665407719011e-06 | 2820594840.675 | 6326043140.25 | 12080454625.873 |
| 2.48150318195964e-06 | 2833089633.941 | 6344119290.06 | 12099875690.966 |
| 2.48636178091622e-06 | 2845561223.511 | 6362091641.302 | 12119063076.695 |
| 2.49122989264877e-06 | 2858008975.565 | 6379959339.212 | 12138016127.274 |
| 2.49610753578258e-06 | 2870432257.273 | 6397721536.429 | 12156734202.921 |
| 2.50099472897945e-06 | 2882830436.857 | 6415377393.062 | 12175216679.88 |
| 2.50589149093767e-06 | 2895202883.652 | 6432926076.761 | 12193462950.423 |
| 2.51079784039218e-06 | 2907548968.172 | 6450366762.778 | 12211472422.863 |
| 2.51571379611459e-06 | 2919868062.165 | 6467698634.03 | 12229244521.563 |
| 2.52063937691324e-06 | 2932159538.678 | 6484920881.168 | 12246778686.935 |
| 2.52557460163333e-06 | 2944422772.12 | 6502032702.63 | 12264074375.45 |
| 2.53051948915694e-06 | 2956657138.315 | 6519033304.709 | 12281131059.637 |
| 2.53547405840312e-06 | 2968862014.572 | 6535921901.61 | 12297948228.082 |
| 2.54043832832796e-06 | 2981036779.738 | 6552697715.509 | 12314525385.429 |
| 2.54541231792467e-06 | 2993180814.261 | 6569359976.61 | 12330862052.372 |
| 2.55039604622365e-06 | 3005293500.249 | 6585907923.201 | 12346957765.654 |
| 2.55538953229255e-06 | 3017374221.529 | 6602340801.712 | 12362812078.058 |
| 2.56039279523637e-06 | 3029422363.708 | 6618657866.766 | 12378424558.398 |
| 2.5654058541975e-06 | 3041437314.228 | 6634858381.234 | 12393794791.507 |
| 2.57042872835579e-06 | 3053418462.429 | 6650941616.287 | 12408922378.23 |
| 2.57546143692871e-06 | 3065365199.604 | 6666906851.445 | 12423806935.402 |
| 2.58050399917128e-06 | 3077276919.058 | 6682753374.632 | 12438448095.839 |
| 2.58555643437627e-06 | 3089153016.166 | 6698480482.216 | 12452845508.318 |
| 2.59061876187421e-06 | 3100992888.429 | 6714087479.067 | 12466998837.556 |
| 2.59569100103346e-06 | 3112795935.531 | 6729573678.595 | 12480907764.195 |
| 2.60077317126032e-06 | 3124561559.398 | 6744938402.8 | 12494571984.772 |
| 2.6058652919991e-06 | 3136289164.25 | 6760180982.314 | 12507991211.701 |
| 2.61096738273214e-06 | 3147978156.66 | 6775300756.445 | 12521165173.243 |
| 2.61607946297997e-06 | 3159627945.608 | 6790297073.22 | 12534093613.483 |
| 2.6212015523013e-06 | 3171237942.538 | 6805169289.424 | 12546776292.297 |
| 2.62633367029317e-06 | 3182807561.41 | 6819916770.642 | 12559212985.324 |
| 2.63147583659095e-06 | 3194336218.754 | 6834538891.293 | 12571403483.933 |
| 2.6366280708685e-06 | 3205823333.728 | 6849035034.674 | 12583347595.189 |
| 2.64179039283816e-06 | 3217268328.167 | 6863404592.993 | 12595045141.819 |
| 2.64696282225089e-06 | 3228670626.639 | 6877646967.401 | 12606495962.173 |
| 2.65214537889631e-06 | 3240029656.495 | 6891761568.032 | 12617699910.188 |
| 2.65733808260279e-06 | 3251344847.924 | 6905747814.034 | 12628656855.346 |
| 2.66254095323753e-06 | 3262615634.002 | 6919605133.597 | 12639366682.637 |
| 2.66775401070661e-06 | 3273841450.746 | 6933332963.99 | 12649829292.508 |
| 2.67297727495509e-06 | 3285021737.164 | 6946930751.585 | 12660044600.828 |
| 2.67821076596711e-06 | 3296155935.303 | 6960397951.889 | 12670012538.834 |
| 2.68345450376589e-06 | 3307243490.303 | 6973734029.57 | 12679733053.092 |
| 2.68870850841388e-06 | 3318283850.444 | 6986938458.483 | 12689206105.44 |
| 2.69397280001282e-06 | 3329276467.195 | 7000010721.694 | 12698431672.943 |
| 2.69924739870379e-06 | 3340220795.264 | 7012950311.508 | 12707409747.84 |
| 2.70453232466731e-06 | 3351116292.643 | 7025756729.487 | 12716140337.492 |
| 2.70982759812342e-06 | 3361962420.661 | 7038429486.473 | 12724623464.326 |
| 2.71513323933173e-06 | 3372758644.027 | 7050968102.61 | 12732859165.782 |
| 2.72044926859154e-06 | 3383504430.874 | 7063372107.364 | 12740847494.252 |
| 2.72577570624187e-06 | 3394199252.814 | 7075641039.537 | 12748588517.024 |
| 2.73111257266159e-06 | 3404842584.975 | 7087774447.29 | 12756082316.225 |
| 2.73645988826944e-06 | 3415433906.048 | 7099771888.153 | 12763328988.755 |
| 2.74181767352418e-06 | 3425972698.336 | 7111632929.045 | 12770328646.226 |
| 2.74718594892457e-06 | 3436458447.792 | 7123357146.286 | 12777081414.903 |
| 2.75256473500956e-06 | 3446890644.067 | 7134944125.609 | 12783587435.633 |
| 2.75795405235828e-06 | 3457268780.55 | 7146393462.173 | 12789846863.781 |
| 2.76335392159017e-06 | 3467592354.412 | 7157704760.572 | 12795859869.165 |
| 2.76876436336502e-06 | 3477860866.647 | 7168877634.847 | 12801626635.985 |
| 2.7741853983831e-06 | 3488073822.116 | 7179911708.49 | 12807147362.755 |
| 2.77961704738518e-06 | 3498230729.581 | 7190806614.457 | 12812422262.23 |
| 2.78505933115265e-06 | 3508331101.755 | 7201561995.169 | 12817451561.336 |
| 2.79051227050761e-06 | 3518374455.333 | 7212177502.521 | 12822235501.096 |
| 2.7959758863129e-06 | 3528360311.035 | 7222652797.884 | 12826774336.555 |
| 2.8014501994722e-06 | 3538288193.644 | 7232987552.107 | 12831068336.707 |
| 2.80693523093016e-06 | 3548157632.047 | 7243181445.522 | 12835117784.414 |
| 2.8124310016724e-06 | 3557968159.264 | 7253234167.943 | 12838922976.335 |
| 2.81793753272565e-06 | 3567719312.493 | 7263145418.666 | 12842484222.84 |
| 2.82345484515778e-06 | 3577410633.145 | 7272914906.466 | 12845801847.936 |
| 2.82898296007795e-06 | 3587041666.876 | 7282542349.6 | 12848876189.182 |
| 2.83452189863663e-06 | 3596611963.622 | 7292027475.798 | 12851707597.611 |
| 2.84007168202568e-06 | 3606121077.64 | 7301370022.26 | 12854296437.644 |
| 2.84563233147849e-06 | 3615568567.535 | 7310569735.653 | 12856643087.011 |
| 2.85120386827e-06 | 3624953996.294 | 7319626372.102 | 12858747936.658 |
| 2.85678631371681e-06 | 3634276931.324 | 7328539697.186 | 12860611390.669 |
| 2.86237968917726e-06 | 3643536944.477 | 7337309485.925 | 12862233866.178 |
| 2.8679840160515e-06 | 3652733612.086 | 7345935522.772 | 12863615793.276 |
| 2.8735993157816e-06 | 3661866514.995 | 7354417601.607 | 12864757614.932 |
| 2.87922560985157e-06 | 3670935238.589 | 7362755525.718 | 12865659786.895 |
| 2.88486291978754e-06 | 3679939372.822 | 7370949107.794 | 12866322777.606 |
| 2.89051126715774e-06 | 3688878512.25 | 7378998169.913 | 12866747068.113 |
| 2.89617067357265e-06 | 3697752256.055 | 7386902543.52 | 12866933151.969 |
| 2.90184116068506e-06 | 3706560208.074 | 7394662069.42 | 12866881535.148 |
| 2.90752275019015e-06 | 3715301976.83 | 7402276597.757 | 12866592735.947 |
| 2.91321546382558e-06 | 3723977175.553 | 7409745987.998 | 12866067284.894 |
| 2.91891932337158e-06 | 3732585422.209 | 7417070108.916 | 12865305724.65 |
| 2.924634350651e-06 | 3741126339.524 | 7424248838.569 | 12864308609.916 |
| 2.93036056752945e-06 | 3749599555.011 | 7431282064.28 | 12863076507.337 |
| 2.93609799591532e-06 | 3758004700.992 | 7438169682.619 | 12861609995.401 |
| 2.94184665775992e-06 | 3766341414.62 | 7444911599.376 | 12859909664.345 |
| 2.94760657505752e-06 | 3774609337.906 | 7451507729.545 | 12857976116.055 |
| 2.95337776984546e-06 | 3782808117.737 | 7457957997.292 | 12855809963.965 |
| 2.95916026420423e-06 | 3790937405.903 | 7464262335.941 | 12853411832.96 |
| 2.96495408025756e-06 | 3798996859.109 | 7470420687.936 | 12850782359.275 |
| 2.97075924017248e-06 | 3806986139.005 | 7476433004.827 | 12847922190.391 |
| 2.97657576615943e-06 | 3814904912.2 | 7482299247.233 | 12844831984.937 |
| 2.98240368047233e-06 | 3822752850.283 | 7488019384.821 | 12841512412.585 |
| 2.98824300540868e-06 | 3830529629.838 | 7493593396.273 | 12837964153.947 |
| 2.99409376330963e-06 | 3838234932.469 | 7499021269.257 | 12834187900.476 |
| 2.99995597656008e-06 | 3845868444.809 | 7504303000.399 | 12830184354.354 |
| 3.00582966758876e-06 | 3853429858.543 | 7509438595.248 | 12825954228.396 |
| 3.01171485886829e-06 | 3860918870.42 | 7514428068.246 | 12821498245.94 |
| 3.01761157291533e-06 | 3868335182.269 | 7519271442.694 | 12816817140.741 |
| 3.02351983229058e-06 | 3875678501.016 | 7523968750.719 | 12811911656.869 |
| 3.02943965959895e-06 | 3882948538.694 | 7528520033.241 | 12806782548.6 |
| 3.03537107748959e-06 | 3890145012.46 | 7532925339.933 | 12801430580.307 |
| 3.041314108656e-06 | 3897267644.606 | 7537184729.189 | 12795856526.358 |
| 3.04726877583611e-06 | 3904316162.573 | 7541298268.086 | 12790061171.006 |
| 3.05323510181237e-06 | 3911290298.957 | 7545266032.346 | 12784045308.279 |
| 3.05921310941184e-06 | 3918189791.528 | 7549088106.299 | 12777809741.874 |
| 3.06520282150627e-06 | 3925014383.235 | 7552764582.84 | 12771355285.046 |
| 3.0712042610122e-06 | 3931763822.217 | 7556295563.394 | 12764682760.504 |
| 3.07721745089101e-06 | 3938437861.81 | 7559681157.873 | 12757793000.294 |
| 3.08324241414907e-06 | 3945036260.562 | 7562921484.636 | 12750686845.697 |
| 3.08927917383779e-06 | 3951558782.231 | 7566016670.444 | 12743365147.112 |
| 3.09532775305369e-06 | 3958005195.801 | 7568966850.422 | 12735828763.952 |
| 3.10138817493854e-06 | 3964375275.483 | 7571772168.012 | 12728078564.528 |
| 3.1074604626794e-06 | 3970668800.726 | 7574432774.93 | 12720115425.944 |
| 3.11354463950873e-06 | 3976885556.215 | 7576948831.122 | 12711940233.98 |
| 3.11964072870449e-06 | 3983025331.884 | 7579320504.72 | 12703553882.985 |
| 3.12574875359021e-06 | 3989087922.914 | 7581547971.992 | 12694957275.764 |
| 3.13186873753507e-06 | 3995073129.741 | 7583631417.299 | 12686151323.465 |
| 3.13800070395404e-06 | 4000980758.056 | 7585571033.046 | 12677136945.473 |
| 3.14414467630791e-06 | 4006810618.807 | 7587367019.638 | 12667915069.29 |
| 3.15030067810339e-06 | 4012562528.204 | 7589019585.426 | 12658486630.428 |
| 3.15646873289326e-06 | 4018236307.717 | 7590528946.659 | 12648852572.297 |
| 3.16264886427637e-06 | 4023831784.08 | 7591895327.441 | 12639013846.091 |
| 3.1688410958978e-06 | 4029348789.285 | 7593118959.672 | 12628971410.675 |
| 3.17504545144892e-06 | 4034787160.59 | 7594200083.004 | 12618726232.476 |
| 3.18126195466747e-06 | 4040146740.509 | 7595138944.784 | 12608279285.365 |
| 3.1874906293377e-06 | 4045427376.818 | 7595935800.009 | 12597631550.551 |
| 3.1937314992904e-06 | 4050628922.548 | 7596590911.267 | 12586784016.462 |
| 3.19998458840302e-06 | 4055751235.981 | 7597104548.691 | 12575737678.639 |
| 3.20624992059978e-06 | 4060794180.653 | 7597476989.898 | 12564493539.616 |
| 3.21252751985172e-06 | 4065757625.343 | 7597708519.941 | 12553052608.814 |
| 3.21881741017684e-06 | 4070641444.073 | 7597799431.253 | 12541415902.423 |
| 3.22511961564012e-06 | 4075445516.099 | 7597750023.592 | 12529584443.295 |
| 3.23143416035372e-06 | 4080169725.911 | 7597560603.986 | 12517559260.827 |
| 3.23776106847694e-06 | 4084813963.221 | 7597231486.677 | 12505341390.848 |
| 3.24410036421645e-06 | 4089378122.959 | 7596762993.063 | 12492931875.513 |
| 3.25045207182626e-06 | 4093862105.266 | 7596155451.647 | 12480331763.182 |
| 3.2568162156079e-06 | 4098265815.485 | 7595409197.973 | 12467542108.314 |
| 3.26319281991048e-06 | 4102589164.152 | 7594524574.573 | 12454563971.353 |
| 3.26958190913075e-06 | 4106832066.991 | 7593501930.909 | 12441398418.617 |
| 3.27598350771328e-06 | 4110994444.899 | 7592341623.312 | 12428046522.181 |
| 3.28239764015045e-06 | 4115076223.94 | 7591044014.926 | 12414509359.775 |
| 3.28882433098263e-06 | 4119077335.333 | 7589609475.647 | 12400788014.663 |
| 3.29526360479822e-06 | 4122997715.442 | 7588038382.065 | 12386883575.536 |
| 3.30171548623377e-06 | 4126837305.763 | 7586331117.404 | 12372797136.401 |
| 3.30817999997405e-06 | 4130596052.914 | 7584488071.462 | 12358529796.47 |
| 3.3146571707522e-06 | 4134273908.618 | 7582509640.55 | 12344082660.048 |
| 3.32114702334974e-06 | 4137870829.698 | 7580396227.429 | 12329456836.422 |
| 3.32764958259673e-06 | 4141386778.055 | 7578148241.255 | 12314653439.752 |
| 3.33416487337186e-06 | 4144821720.659 | 7575766097.511 | 12299673588.962 |
| 3.34069292060251e-06 | 4148175629.533 | 7573250217.949 | 12284518407.627 |
| 3.34723374926487e-06 | 4151448481.739 | 7570601030.528 | 12269189023.867 |
| 3.35378738438404e-06 | 4154640259.361 | 7567818969.348 | 12253686570.234 |
| 3.3603538510341e-06 | 4157750949.491 | 7564904474.593 | 12238012183.605 |
| 3.36693317433825e-06 | 4160780544.209 | 7561857992.463 | 12222167005.075 |
| 3.37352537946885e-06 | 4163729040.572 | 7558679975.116 | 12206152179.846 |
| 3.38013049164757e-06 | 4166596440.59 | 7555370880.598 | 12189968857.118 |
| 3.38674853614545e-06 | 4169382751.215 | 7551931172.786 | 12173618189.986 |
| 3.393379538283e-06 | 4172087984.317 | 7548361321.32 | 12157101335.327 |
| 3.40002352343033e-06 | 4174712156.668 | 7544661801.542 | 12140419453.697 |
| 3.4066805170072e-06 | 4177255289.924 | 7540833094.427 | 12123573709.221 |
| 3.41335054448315e-06 | 4179717410.602 | 7536875686.526 | 12106565269.492 |
| 3.4200336313776e-06 | 4182098550.064 | 7532790069.894 | 12089395305.457 |
| 3.4267298032599e-06 | 4184398744.495 | 7528576742.028 | 12072064991.32 |
| 3.4334390857495e-06 | 4186618034.88 | 7524236205.804 | 12054575504.431 |
| 3.44016150451599e-06 | 4188756466.987 | 7519768969.41 | 12036928025.183 |
| 3.44689708527923e-06 | 4190814091.342 | 7515175546.28 | 12019123736.908 |
| 3.45364585380942e-06 | 4192790963.209 | 7510456455.03 | 12001163825.772 |
| 3.46040783592724e-06 | 4194687142.565 | 7505612219.391 | 11983049480.675 |
| 3.46718305750391e-06 | 4196502694.081 | 7500643368.146 | 11964781893.142 |
| 3.4739715444613e-06 | 4198237687.097 | 7495550435.061 | 11946362257.226 |
| 3.48077332277205e-06 | 4199892195.596 | 7490333958.822 | 11927791769.403 |
| 3.48758841845965e-06 | 4201466298.183 | 7484994482.964 | 11909071628.471 |
| 3.49441685759851e-06 | 4202960078.063 | 7479532555.814 | 11890203035.448 |
| 3.50125866631414e-06 | 4204373623.008 | 7473948730.413 | 11871187193.474 |
| 3.50811387078317e-06 | 4205707025.342 | 7468243564.462 | 11852025307.706 |
| 3.51498249723349e-06 | 4206960381.909 | 7462417620.246 | 11832718585.225 |
| 3.52186457194434e-06 | 4208133794.047 | 7456471464.572 | 11813268234.931 |
| 3.52876012124642e-06 | 4209227367.567 | 7450405668.702 | 11793675467.445 |
| 3.53566917152198e-06 | 4210241212.723 | 7444220808.288 | 11773941495.015 |
| 3.54259174920492e-06 | 4211175444.184 | 7437917463.302 | 11754067531.413 |
| 3.54952788078089e-06 | 4212030181.01 | 7431496217.973 | 11734054791.843 |
| 3.55647759278743e-06 | 4212805546.624 | 7424957660.718 | 11713904492.841 |
| 3.563440911814e-06 | 4213501668.781 | 7418302384.077 | 11693617852.179 |
| 3.57041786450213e-06 | 4214118679.546 | 7411530984.647 | 11673196088.772 |
| 3.57740847754552e-06 | 4214656715.258 | 7404644063.013 | 11652640422.58 |
| 3.58441277769014e-06 | 4215115916.51 | 7397642223.683 | 11631952074.518 |
| 3.59143079173431e-06 | 4215496428.11 | 7390526075.025 | 11611132266.358 |
| 3.59846254652883e-06 | 4215798399.063 | 7383296229.192 | 11590182220.636 |
| 3.60550806897706e-06 | 4216021982.532 | 7375953302.065 | 11569103160.565 |
| 3.61256738603506e-06 | 4216167335.812 | 7368497913.181 | 11547896309.936 |
| 3.61964052471164e-06 | 4216234620.302 | 7360930685.667 | 11526562893.031 |
| 3.6267275120685e-06 | 4216224001.471 | 7353252246.179 | 11505104134.53 |
| 3.63382837522034e-06 | 4216135648.828 | 7345463224.828 | 11483521259.423 |
| 3.64094314133493e-06 | 4215969735.894 | 7337564255.119 | 11461815492.918 |
| 3.64807183763323e-06 | 4215726440.169 | 7329555973.886 | 11439988060.354 |
| 3.65521449138951e-06 | 4215405943.097 | 7321439021.222 | 11418040187.113 |
| 3.66237112993145e-06 | 4215008430.042 | 7313214040.416 | 11395973098.53 |
| 3.66954178064021e-06 | 4214534090.251 | 7304881677.887 | 11373788019.809 |
| 3.67672647095057e-06 | 4213983116.821 | 7296442583.118 | 11351486175.934 |
| 3.68392522835103e-06 | 4213355706.671 | 7287897408.591 | 11329068791.585 |
| 3.69113808038391e-06 | 4212652060.507 | 7279246809.722 | 11306537091.052 |
| 3.69836505464545e-06 | 4211872382.788 | 7270491444.795 | 11283892298.151 |
| 3.70560617878592e-06 | 4211016881.696 | 7261631974.897 | 11261135636.14 |
| 3.71286148050975e-06 | 4210085769.101 | 7252669063.855 | 11238268327.638 |
| 3.72013098757558e-06 | 4209079260.528 | 7243603378.169 | 11215291594.538 |
| 3.72741472779642e-06 | 4207997575.124 | 7234435586.949 | 11192206657.928 |
| 3.73471272903973e-06 | 4206840935.623 | 7225166361.849 | 11169014738.013 |
| 3.74202501922754e-06 | 4205609568.314 | 7215796377.005 | 11145717054.028 |
| 3.74935162633652e-06 | 4204303703.005 | 7206326308.97 | 11122314824.164 |
| 3.75669257839817e-06 | 4202923572.99 | 7196756836.651 | 11098809265.484 |
| 3.76404790349881e-06 | 4201469415.016 | 7187088641.241 | 11075201593.85 |
| 3.77141762977981e-06 | 4199941469.244 | 7177322406.165 | 11051493023.842 |
| 3.7788017854376e-06 | 4198339979.219 | 7167458817.005 | 11027684768.681 |
| 3.78620039872382e-06 | 4196665191.833 | 7157498561.447 | 11003778040.154 |
| 3.79361349794545e-06 | 4194917357.289 | 7147442329.213 | 10979774048.536 |
| 3.80104111146486e-06 | 4193096729.069 | 7137290812 | 10955674002.521 |
| 3.80848326769998e-06 | 4191203563.896 | 7127044703.417 | 10931479109.14 |
| 3.81593999512436e-06 | 4189238121.698 | 7116704698.925 | 10907190573.692 |
| 3.82341132226731e-06 | 4187200665.578 | 7106271495.77 | 10882809599.672 |
| 3.830897277714e-06 | 4185091461.769 | 7095745792.929 | 10858337388.696 |
| 3.83839789010554e-06 | 4182910779.608 | 7085128291.043 | 10833775140.432 |
| 3.84591318813917e-06 | 4180658891.494 | 7074419692.357 | 10809124052.528 |
| 3.85344320056826e-06 | 4178336072.854 | 7063620700.661 | 10784385320.542 |
| 3.86098795620253e-06 | 4175942602.106 | 7052732021.227 | 10759560137.877 |
| 3.86854748390805e-06 | 4173478760.626 | 7041754360.751 | 10734649695.703 |
| 3.87612181260747e-06 | 4170944832.707 | 7030688427.292 | 10709655182.9 |
| 3.88371097128001e-06 | 4168341105.526 | 7019534930.212 | 10684577785.983 |
| 3.89131498896168e-06 | 4165667869.107 | 7008294580.116 | 10659418689.042 |
| 3.8989338947453e-06 | 4162925416.286 | 6996968088.796 | 10634179073.67 |
| 3.90656771778067e-06 | 4160114042.669 | 6985556169.169 | 10608860118.903 |
| 3.91421648727466e-06 | 4157234046.603 | 6974059535.218 | 10583463001.155 |
| 3.92188023249134e-06 | 4154285729.134 | 6962478901.936 | 10557988894.15 |
| 3.92955898275205e-06 | 4151269393.973 | 6950814985.269 | 10532438968.869 |
| 3.93725276743555e-06 | 4148185347.457 | 6939068502.055 | 10506814393.476 |
| 3.94496161597813e-06 | 4145033898.515 | 6927240169.968 | 10481116333.267 |
| 3.95268555787371e-06 | 4141815358.628 | 6915330707.463 | 10455345950.604 |
| 3.96042462267395e-06 | 4138530041.797 | 6903340833.716 | 10429504404.856 |
| 3.96817883998837e-06 | 4135178264.499 | 6891271268.571 | 10403592852.342 |
| 3.97594823948448e-06 | 4131760345.659 | 6879122732.483 | 10377612446.269 |
| 3.98373285088785e-06 | 4128276606.604 | 6866895946.459 | 10351564336.678 |
| 3.99153270398227e-06 | 4124727371.034 | 6854591632.009 | 10325449670.386 |
| 3.99934782860984e-06 | 4121112964.98 | 6842210511.086 | 10299269590.929 |
| 4.00717825467109e-06 | 4117433716.767 | 6829753306.033 | 10273025238.506 |
| 4.01502401212509e-06 | 4113689956.983 | 6817220739.528 | 10246717749.927 |
| 4.02288513098957e-06 | 4109882018.434 | 6804613534.534 | 10220348258.557 |
| 4.03076164134102e-06 | 4106010236.113 | 6791932414.239 | 10193917894.263 |
| 4.03865357331484e-06 | 4102074947.16 | 6779178102.007 | 10167427783.362 |
| 4.04656095710543e-06 | 4098076490.828 | 6766351321.327 | 10140879048.569 |
| 4.05448382296628e-06 | 4094015208.443 | 6753452795.754 | 10114272808.944 |
| 4.06242220121014e-06 | 4089891443.368 | 6740483248.864 | 10087610179.847 |
| 4.07037612220911e-06 | 4085705540.968 | 6727443404.197 | 10060892272.881 |
| 4.07834561639474e-06 | 4081457848.573 | 6714333985.209 | 10034120195.849 |
| 4.08633071425818e-06 | 4077148715.439 | 6701155715.22 | 10007295052.704 |
| 4.09433144635028e-06 | 4072778492.712 | 6687909317.363 | 9980417943.5 |
| 4.10234784328169e-06 | 4068347533.394 | 6674595514.534 | 9953489964.348 |
| 4.110379935723e-06 | 4063856192.305 | 6661215029.343 | 9926512207.366 |
| 4.11842775440485e-06 | 4059304826.043 | 6647768584.063 | 9899485760.64 |
| 4.12649133011807e-06 | 4054693792.954 | 6634256900.583 | 9872411708.172 |
| 4.13457069371373e-06 | 4050023453.09 | 6620680700.358 | 9845291129.841 |
| 4.14266587610336e-06 | 4045294168.176 | 6607040704.36 | 9818125101.358 |
| 4.15077690825896e-06 | 4040506301.574 | 6593337633.033 | 9790914694.224 |
| 4.1589038212132e-06 | 4035660218.242 | 6579572206.244 | 9763660975.69 |
| 4.16704664605952e-06 | 4030756284.706 | 6565745143.234 | 9736365008.711 |
| 4.17520541395221e-06 | 4025794869.016 | 6551857162.574 | 9709027851.909 |
| 4.18338015610657e-06 | 4020776340.716 | 6537908982.119 | 9681650559.537 |
| 4.19157090379902e-06 | 4015701070.803 | 6523901318.96 | 9654234181.43 |
| 4.19977768836721e-06 | 4010569431.697 | 6509834889.38 | 9626779762.977 |
| 4.20800054121017e-06 | 4005381797.201 | 6495710408.81 | 9599288345.078 |
| 4.21623949378837e-06 | 4000138542.467 | 6481528591.782 | 9571760964.108 |
| 4.2244945776239e-06 | 3994840043.96 | 6467290151.887 | 9544198651.88 |
| 4.23276582430057e-06 | 3989486679.425 | 6452995801.729 | 9516602435.612 |
| 4.24105326546402e-06 | 3984078827.848 | 6438646252.885 | 9488973337.889 |
| 4.24935693282185e-06 | 3978616869.424 | 6424242215.857 | 9461312376.632 |
| 4.25767685814375e-06 | 3973101185.521 | 6409784400.037 | 9433620565.062 |
| 4.2660130732616e-06 | 3967532158.643 | 6395273513.656 | 9405898911.667 |
| 4.27436561006961e-06 | 3961910172.4 | 6380710263.751 | 9378148420.173 |
| 4.28273450052444e-06 | 3956235611.47 | 6366095356.117 | 9350370089.509 |
| 4.29111977664532e-06 | 3950508861.564 | 6351429495.269 | 9322564913.777 |
| 4.29952147051416e-06 | 3944730309.394 | 6336713384.403 | 9294733882.223 |
| 4.30793961427569e-06 | 3938900342.639 | 6321947725.354 | 9266877979.208 |
| 4.31637424013759e-06 | 3933019349.907 | 6307133218.556 | 9238998184.177 |
| 4.32482538037058e-06 | 3927087720.705 | 6292270563.005 | 9211095471.631 |
| 4.33329306730857e-06 | 3921105845.404 | 6277360456.219 | 9183170811.101 |
| 4.34177733334879e-06 | 3915074115.206 | 6262403594.2 | 9155225167.122 |
| 4.35027821095188e-06 | 3908992922.109 | 6247400671.395 | 9127259499.201 |
| 4.35879573264205e-06 | 3902862658.875 | 6232352380.662 | 9099274761.8 |
| 4.36732993100719e-06 | 3896683718.995 | 6217259413.229 | 9071271904.303 |
| 4.37588083869899e-06 | 3890456496.659 | 6202122458.66 | 9043251870.999 |
| 4.38444848843306e-06 | 3884181386.723 | 6186942204.819 | 9015215601.05 |
| 4.3930329129891e-06 | 3877858784.67 | 6171719337.831 | 8987164028.475 |
| 4.40163414521094e-06 | 3871489086.587 | 6156454542.052 | 8959098082.125 |
| 4.41025221800676e-06 | 3865072689.127 | 6141148500.03 | 8931018685.661 |
| 4.41888716434914e-06 | 3858609989.475 | 6125801892.472 | 8902926757.531 |
| 4.42753901727524e-06 | 3852101385.323 | 6110415398.211 | 8874823210.953 |
| 4.43620780988689e-06 | 3845547274.831 | 6094989694.17 | 8846708953.894 |
| 4.44489357535074e-06 | 3838948056.599 | 6079525455.333 | 8818584889.046 |
| 4.45359634689837e-06 | 3832304129.636 | 6064023354.707 | 8790451913.816 |
| 4.46231615782643e-06 | 3825615893.326 | 6048484063.295 | 8762310920.298 |
| 4.47105304149677e-06 | 3818883747.4 | 6032908250.059 | 8734162795.265 |
| 4.47980703133654e-06 | 3812108091.902 | 6017296581.894 | 8706008420.143 |
| 4.48857816083836e-06 | 3805289327.162 | 6001649723.594 | 8677848671.001 |
| 4.49736646356041e-06 | 3798427853.76 | 5985968337.819 | 8649684418.531 |
| 4.50617197312658e-06 | 3791524072.503 | 5970253085.073 | 8621516528.037 |
| 4.51499472322659e-06 | 3784578384.388 | 5954504623.664 | 8593345859.417 |
| 4.52383474761613e-06 | 3777591190.575 | 5938723609.682 | 8565173267.149 |
| 4.53269208011697e-06 | 3770562892.359 | 5922910696.97 | 8536999600.278 |
| 4.54156675461711e-06 | 3763493891.138 | 5907066537.09 | 8508825702.404 |
| 4.55045880507091e-06 | 3756384588.381 | 5891191779.3 | 8480652411.669 |
| 4.55936826549917e-06 | 3749235385.607 | 5875287070.527 | 8452480560.744 |
| 4.56829516998935e-06 | 3742046684.349 | 5859353055.336 | 8424310976.819 |
| 4.57723955269562e-06 | 3734818886.126 | 5843390375.906 | 8396144481.591 |
| 4.58620144783903e-06 | 3727552392.417 | 5827399672.002 | 8367981891.256 |
| 4.59518088970762e-06 | 3720247604.633 | 5811381580.951 | 8339824016.495 |
| 4.60417791265659e-06 | 3712904924.086 | 5795336737.616 | 8311671662.471 |
| 4.61319255110839e-06 | 3705524751.962 | 5779265774.37 | 8283525628.814 |
| 4.62222483955286e-06 | 3698107489.296 | 5763169321.072 | 8255386709.617 |
| 4.63127481254738e-06 | 3690653536.939 | 5747048005.043 | 8227255693.427 |
| 4.64034250471697e-06 | 3683163295.538 | 5730902451.043 | 8199133363.238 |
| 4.64942795075448e-06 | 3675637165.503 | 5714733281.244 | 8171020496.484 |
| 4.65853118542066e-06 | 3668075546.982 | 5698541115.213 | 8142917865.033 |
| 4.66765224354431e-06 | 3660478839.837 | 5682326569.883 | 8114826235.184 |
| 4.67679116002246e-06 | 3652847443.613 | 5666090259.536 | 8086746367.658 |
| 4.68594796982042e-06 | 3645181757.515 | 5649832795.779 | 8058679017.594 |
| 4.69512270797199e-06 | 3637482180.383 | 5633554787.522 | 8030624934.547 |
| 4.70431540957955e-06 | 3629749110.661 | 5617256840.958 | 8002584862.486 |
| 4.71352610981422e-06 | 3621982946.379 | 5600939559.544 | 7974559539.784 |
| 4.72275484391598e-06 | 3614184085.122 | 5584603543.978 | 7946549699.222 |
| 4.73200164719379e-06 | 3606352924.007 | 5568249392.18 | 7918556067.983 |
| 4.74126655502576e-06 | 3598489859.658 | 5551877699.274 | 7890579367.655 |
| 4.75054960285927e-06 | 3590595288.182 | 5535489057.568 | 7862620314.222 |
| 4.75985082621108e-06 | 3582669605.146 | 5519084056.537 | 7834679618.071 |
| 4.76917026066752e-06 | 3574713205.547 | 5502663282.802 | 7806757983.986 |
| 4.77850794188457e-06 | 3566726483.795 | 5486227320.114 | 7778856111.153 |
| 4.78786390558804e-06 | 3558709833.688 | 5469776749.337 | 7750974693.156 |
| 4.79723818757368e-06 | 3550663648.384 | 5453312148.431 | 7723114417.981 |
| 4.80663082370732e-06 | 3542588320.384 | 5436834092.434 | 7695275968.016 |
| 4.81604184992502e-06 | 3534484241.504 | 5420343153.446 | 7667460020.052 |
| 4.82547130223321e-06 | 3526351802.856 | 5403839900.615 | 7639667245.29 |
| 4.83491921670879e-06 | 3518191394.823 | 5387324900.12 | 7611898309.337 |
| 4.84438562949933e-06 | 3510003407.038 | 5370798715.157 | 7584153872.214 |
| 4.85387057682315e-06 | 3501788228.364 | 5354261905.923 | 7556434588.359 |
| 4.86337409496948e-06 | 3493546246.866 | 5337715029.601 | 7528741106.627 |
| 4.87289622029862e-06 | 3485277849.796 | 5321158640.35 | 7501074070.3 |
| 4.88243698924206e-06 | 3476983423.57 | 5304593289.287 | 7473434117.088 |
| 4.89199643830259e-06 | 3468663353.745 | 5288019524.475 | 7445821879.136 |
| 4.90157460405452e-06 | 3460318025 | 5271437890.912 | 7418237983.027 |
| 4.91117152314372e-06 | 3451947821.114 | 5254848930.518 | 7390683049.792 |
| 4.92078723228785e-06 | 3443553124.947 | 5238253182.119 | 7363157694.914 |
| 4.93042176827642e-06 | 3435134318.42 | 5221651181.44 | 7335662528.332 |
| 4.94007516797102e-06 | 3426691782.495 | 5205043461.094 | 7308198154.453 |
| 4.94974746830536e-06 | 3418225897.152 | 5188430550.565 | 7280765172.158 |
| 4.9594387062855e-06 | 3409737041.378 | 5171812976.203 | 7253364174.808 |
| 4.96914891898995e-06 | 3401225593.137 | 5155191261.212 | 7225995750.253 |
| 4.9788781435698e-06 | 3392691929.36 | 5138565925.64 | 7198660480.841 |
| 4.9886264172489e-06 | 3384136425.921 | 5121937486.369 | 7171358943.428 |
| 4.99839377732397e-06 | 3375559457.623 | 5105306457.104 | 7144091709.384 |
| 5.00818026116475e-06 | 3366961398.175 | 5088673348.367 | 7116859344.606 |
| 5.01798590621415e-06 | 3358342620.177 | 5072038667.489 | 7089662409.524 |
| 5.02781074998841e-06 | 3349703495.103 | 5055402918.597 | 7062501459.118 |
| 5.03765483007719e-06 | 3341044393.28 | 5038766602.611 | 7035377042.919 |
| 5.04751818414378e-06 | 3332365683.875 | 5022130217.232 | 7008289705.029 |
| 5.05740084992519e-06 | 3323667734.876 | 5005494256.941 | 6981239984.127 |
| 5.06730286523232e-06 | 3314950913.072 | 4988859212.983 | 6954228413.481 |
| 5.07722426795012e-06 | 3306215584.045 | 4972225573.369 | 6927255520.963 |
| 5.08716509603768e-06 | 3297462112.144 | 4955593822.864 | 6900321829.055 |
| 5.09712538752844e-06 | 3288690860.475 | 4938964442.985 | 6873427854.87 |
| 5.1071051805303e-06 | 3279902190.886 | 4922337911.991 | 6846574110.156 |
| 5.11710451322577e-06 | 3271096463.944 | 4905714704.882 | 6819761101.316 |
| 5.12712342387211e-06 | 3262274038.929 | 4889095293.39 | 6792989329.416 |
| 5.13716195080151e-06 | 3253435273.814 | 4872480145.977 | 6766259290.204 |
| 5.14722013242119e-06 | 3244580525.248 | 4855869727.83 | 6739571474.118 |
| 5.15729800721357e-06 | 3235710148.546 | 4839264500.856 | 6712926366.306 |
| 5.16739561373642e-06 | 3226824497.674 | 4822664923.678 | 6686324446.635 |
| 5.177512990623e-06 | 3217923925.231 | 4806071451.633 | 6659766189.709 |
| 5.18765017658223e-06 | 3209008782.439 | 4789484536.768 | 6633252064.886 |
| 5.19780721039878e-06 | 3200079419.127 | 4772904627.836 | 6606782536.287 |
| 5.2079841309333e-06 | 3191136183.72 | 4756332170.295 | 6580358062.818 |
| 5.2181809771225e-06 | 3182179423.221 | 4739767606.304 | 6553979098.181 |
| 5.22839778797933e-06 | 3173209483.205 | 4723211374.723 | 6527646090.893 |
| 5.23863460259313e-06 | 3164226707.8 | 4706663911.108 | 6501359484.301 |
| 5.24889146012977e-06 | 3155231439.676 | 4690125647.712 | 6475119716.599 |
| 5.2591683998318e-06 | 3146224020.035 | 4673597013.485 | 6448927220.844 |
| 5.26946546101861e-06 | 3137204788.597 | 4657078434.069 | 6422782424.974 |
| 5.27978268308658e-06 | 3128174083.588 | 4640570331.8 | 6396685751.823 |
| 5.29012010550921e-06 | 3119132241.728 | 4624073125.708 | 6370637619.143 |
| 5.3004777678373e-06 | 3110079598.223 | 4607587231.514 | 6344638439.617 |
| 5.31085570969908e-06 | 3101016486.748 | 4591113061.634 | 6318688620.878 |
| 5.32125397080037e-06 | 3091943239.439 | 4574651025.176 | 6292788565.53 |
| 5.33167259092474e-06 | 3082860186.886 | 4558201527.941 | 6266938671.161 |
| 5.34211160993363e-06 | 3073767658.115 | 4541764972.428 | 6241139330.367 |
| 5.35257106776655e-06 | 3064665980.582 | 4525341757.83 | 6215390930.768 |
| 5.3630510044412e-06 | 3055555480.164 | 4508932280.036 | 6189693855.024 |
| 5.37355146005363e-06 | 3046436481.145 | 4492536931.637 | 6164048480.861 |
| 5.3840724747784e-06 | 3037309306.212 | 4476156101.922 | 6138455181.086 |
| 5.39461408886872e-06 | 3028174276.438 | 4459790176.885 | 6112914323.604 |
| 5.40517634265662e-06 | 3019031711.281 | 4443439539.225 | 6087426271.443 |
| 5.4157592765531e-06 | 3009881928.567 | 4427104568.348 | 6061991382.772 |
| 5.42636293104827e-06 | 3000725244.489 | 4410785640.372 | 6036610010.919 |
| 5.43698734671152e-06 | 2991561973.591 | 4394483128.129 | 6011282504.392 |
| 5.44763256419168e-06 | 2982392428.766 | 4378197401.167 | 5986009206.901 |
| 5.45829862421717e-06 | 2973216921.243 | 4361928825.755 | 5960790457.379 |
| 5.46898556759614e-06 | 2964035760.581 | 4345677764.888 | 5935626589.997 |
| 5.47969343521665e-06 | 2954849254.662 | 4329444578.288 | 5910517934.193 |
| 5.4904222680468e-06 | 2945657709.681 | 4313229622.411 | 5885464814.686 |
| 5.50117210713492e-06 | 2936461430.142 | 4297033250.448 | 5860467551.503 |
| 5.5119429936097e-06 | 2927260718.847 | 4280855812.334 | 5835526459.994 |
| 5.52273496868037e-06 | 2918055876.892 | 4264697654.75 | 5810641850.858 |
| 5.53354807363683e-06 | 2908847203.66 | 4248559121.128 | 5785814030.165 |
| 5.54438234984982e-06 | 2899634996.812 | 4232440551.658 | 5761043299.374 |
| 5.55523783877109e-06 | 2890419552.283 | 4216342283.291 | 5736329955.357 |
| 5.56611458193356e-06 | 2881201164.274 | 4200264649.748 | 5711674290.422 |
| 5.57701262095144e-06 | 2871980125.25 | 4184207981.524 | 5687076592.331 |
| 5.58793199752045e-06 | 2862756725.927 | 4168172605.891 | 5662537144.329 |
| 5.59887275341791e-06 | 2853531255.275 | 4152158846.911 | 5638056225.159 |
| 5.60983493050298e-06 | 2844304000.506 | 4136167025.436 | 5613634109.09 |
| 5.62081857071673e-06 | 2835075247.071 | 4120197459.121 | 5589271065.935 |
| 5.6318237160824e-06 | 2825845278.656 | 4104250462.423 | 5564967361.079 |
| 5.64285040870546e-06 | 2816614377.174 | 4088326346.615 | 5540723255.496 |
| 5.65389869077384e-06 | 2807382822.767 | 4072425419.79 | 5516539005.776 |
| 5.66496860455808e-06 | 2798150893.792 | 4056547986.869 | 5492414864.147 |
| 5.67606019241147e-06 | 2788918866.826 | 4040694349.608 | 5468351078.496 |
| 5.68717349677023e-06 | 2779687016.656 | 4024864806.607 | 5444347892.395 |
| 5.69830856015366e-06 | 2770455616.276 | 4009059653.316 | 5420405545.123 |
| 5.70946542516432e-06 | 2761224936.885 | 3993279182.044 | 5396524271.69 |
| 5.72064413448818e-06 | 2751995247.883 | 3977523681.97 | 5372704302.858 |
| 5.73184473089477e-06 | 2742766816.866 | 3961793439.144 | 5348945865.168 |
| 5.74306725723738e-06 | 2733539909.626 | 3946088736.506 | 5325249180.961 |
| 5.7543117564532e-06 | 2724314790.144 | 3930409853.885 | 5301614468.403 |
| 5.76557827156348e-06 | 2715091720.59 | 3914757068.013 | 5278041941.508 |
| 5.7768668456737e-06 | 2705870961.319 | 3899130652.534 | 5254531810.162 |
| 5.78817752197375e-06 | 2696652770.869 | 3883530878.011 | 5231084280.148 |
| 5.79951034373809e-06 | 2687437405.96 | 3867958011.936 | 5207699553.166 |
| 5.81086535432587e-06 | 2678225121.487 | 3852412318.743 | 5184377826.864 |
| 5.82224259718118e-06 | 2669016170.525 | 3836894059.811 | 5161119294.854 |
| 5.83364211583313e-06 | 2659810804.322 | 3821403493.479 | 5137924146.743 |
| 5.84506395389609e-06 | 2650609272.299 | 3805940875.055 | 5114792568.152 |
| 5.8565081550698e-06 | 2641411822.047 | 3790506456.824 | 5091724740.744 |
| 5.86797476313958e-06 | 2632218699.33 | 3775100488.06 | 5068720842.244 |
| 5.87946382197646e-06 | 2623030148.079 | 3759723215.036 | 5045781046.47 |
| 5.89097537553738e-06 | 2613846410.393 | 3744374881.034 | 5022905523.349 |
| 5.90250946786533e-06 | 2604667726.536 | 3729055726.356 | 5000094438.949 |
| 5.91406614308955e-06 | 2595494334.943 | 3713765988.334 | 4977347955.499 |
| 5.92564544542568e-06 | 2586326472.209 | 3698505901.343 | 4954666231.412 |
| 5.93724741917592e-06 | 2577164373.098 | 3683275696.808 | 4932049421.316 |
| 5.9488721087292e-06 | 2568008270.538 | 3668075603.219 | 4909497676.072 |
| 5.9605195585614e-06 | 2558858395.621 | 3652905846.139 | 4887011142.801 |
| 5.97218981323544e-06 | 2549714977.605 | 3637766648.219 | 4864589964.911 |
| 5.98388291740152e-06 | 2540578243.91 | 3622658229.206 | 4842234282.115 |
| 5.99559891579723e-06 | 2531448420.126 | 3607580805.954 | 4819944230.464 |
| 6.00733785324778e-06 | 2522325730.006 | 3592534592.44 | 4797719942.364 |
| 6.01909977466614e-06 | 2513210395.468 | 3577519799.773 | 4775561546.607 |
| 6.03088472505322e-06 | 2504102636.601 | 3562536636.204 | 4753469168.391 |
| 6.04269274949801e-06 | 2495002671.657 | 3547585307.14 | 4731442929.345 |
| 6.05452389317781e-06 | 2485910717.062 | 3532666015.157 | 4709482947.559 |
| 6.06637820135838e-06 | 2476826987.409 | 3517778960.011 | 4687589337.601 |
| 6.07825571939407e-06 | 2467751695.463 | 3502924338.65 | 4665762210.547 |
| 6.09015649272806e-06 | 2458685052.163 | 3488102345.225 | 4644001674.003 |
| 6.1020805668925e-06 | 2449627266.62 | 3473313171.105 | 4622307832.133 |
| 6.11402798750869e-06 | 2440578546.124 | 3458557004.89 | 4600680785.678 |
| 6.12599880028725e-06 | 2431539096.141 | 3443834032.418 | 4579120631.987 |
| 6.13799305102828e-06 | 2422509120.317 | 3429144436.785 | 4557627465.038 |
| 6.15001078562158e-06 | 2413488820.48 | 3414488398.354 | 4536201375.461 |
| 6.1620520500468e-06 | 2404478396.643 | 3399866094.765 | 4514842450.57 |
| 6.17411689037359e-06 | 2395478047.004 | 3385277700.956 | 4493550774.377 |
| 6.18620535276182e-06 | 2386487967.951 | 3370723389.168 | 4472326427.627 |
| 6.19831748346172e-06 | 2377508354.062 | 3356203328.96 | 4451169487.815 |
| 6.21045332881411e-06 | 2368539398.11 | 3341717687.225 | 4430080029.214 |
| 6.2226129352505e-06 | 2359581291.065 | 3327266628.202 | 4409058122.9 |
| 6.23479634929333e-06 | 2350634222.096 | 3312850313.487 | 4388103836.775 |
| 6.24700361755613e-06 | 2341698378.576 | 3298468902.049 | 4367217235.59 |
| 6.25923478674369e-06 | 2332773946.081 | 3284122550.242 | 4346398380.976 |
| 6.27148990365225e-06 | 2323861108.4 | 3269811411.819 | 4325647331.461 |
| 6.28376901516966e-06 | 2314960047.531 | 3255535637.944 | 4304964142.497 |
| 6.29607216827559e-06 | 2306070943.69 | 3241295377.208 | 4284348866.486 |
| 6.30839941004169e-06 | 2297193975.312 | 3227090775.643 | 4263801552.802 |
| 6.32075078763175e-06 | 2288329319.055 | 3212921976.732 | 4243322247.82 |
| 6.33312634830194e-06 | 2279477149.803 | 3198789121.425 | 4222910994.932 |
| 6.34552613940092e-06 | 2270637640.672 | 3184692348.153 | 4202567834.579 |
| 6.35795020837008e-06 | 2261810963.012 | 3170631792.843 | 4182292804.272 |
| 6.37039860274369e-06 | 2252997286.412 | 3156607588.928 | 4162085938.616 |
| 6.38287137014907e-06 | 2244196778.705 | 3142619867.365 | 4141947269.333 |
| 6.39536855830682e-06 | 2235409605.97 | 3128668756.648 | 4121876825.291 |
| 6.40789021503096e-06 | 2226635932.538 | 3114754382.819 | 4101874632.523 |
| 6.42043638822911e-06 | 2217875920.995 | 3100876869.485 | 4081940714.251 |
| 6.43300712590272e-06 | 2209129732.19 | 3087036337.834 | 4062075090.914 |
| 6.44560247614721e-06 | 2200397525.236 | 3073232906.643 | 4042277780.189 |
| 6.45822248715216e-06 | 2191679457.515 | 3059466692.299 | 4022548797.014 |
| 6.47086720720151e-06 | 2182975684.685 | 3045737808.808 | 4002888153.615 |
| 6.48353668467374e-06 | 2174286360.684 | 3032046367.811 | 3983295859.527 |
| 6.49623096804203e-06 | 2165611637.734 | 3018392478.601 | 3963771921.617 |
| 6.5089501058745e-06 | 2156951666.347 | 3004776248.132 | 3944316344.113 |
| 6.52169414683433e-06 | 2148306595.33 | 2991197781.037 | 3924929128.619 |
| 6.53446313968e-06 | 2139676571.791 | 2977657179.642 | 3905610274.146 |
| 6.54725713326545e-06 | 2131061741.142 | 2964154543.98 | 3886359777.133 |
| 6.56007617654028e-06 | 2122462247.107 | 2950689971.804 | 3867177631.467 |
| 6.57292031854991e-06 | 2113878231.726 | 2937263558.605 | 3848063828.512 |
| 6.5857896084358e-06 | 2105309835.361 | 2923875397.621 | 3829018357.13 |
| 6.59868409543563e-06 | 2096757196.702 | 2910525579.857 | 3810041203.7 |
| 6.61160382888347e-06 | 2088220452.773 | 2897214194.095 | 3791132352.149 |
| 6.62454885821001e-06 | 2079699738.934 | 2883941326.914 | 3772291783.968 |
| 6.63751923294267e-06 | 2071195188.893 | 2870707062.697 | 3753519478.239 |
| 6.6505150027059e-06 | 2062706934.709 | 2857511483.652 | 3734815411.657 |
| 6.66353621722128e-06 | 2054235106.796 | 2844354669.823 | 3716179558.55 |
| 6.67658292630773e-06 | 2045779833.931 | 2831236699.107 | 3697611890.907 |
| 6.68965517988174e-06 | 2037341243.262 | 2818157647.266 | 3679112378.397 |
| 6.70275302795752e-06 | 2028919460.311 | 2805117587.943 | 3660680988.393 |
| 6.7158765206472e-06 | 2020514608.98 | 2792116592.676 | 3642317685.993 |
| 6.72902570816103e-06 | 2012126811.562 | 2779154730.913 | 3624022434.043 |
| 6.74220064080756e-06 | 2003756188.741 | 2766232070.027 | 3605795193.162 |
| 6.75540136899386e-06 | 1995402859.603 | 2753348675.329 | 3587635921.76 |
| 6.76862794322568e-06 | 1987066941.642 | 2740504610.086 | 3569544576.064 |
| 6.78188041410766e-06 | 1978748550.764 | 2727699935.53 | 3551521110.137 |
| 6.79515883234351e-06 | 1970447801.297 | 2714934710.877 | 3533565475.901 |
| 6.80846324873622e-06 | 1962164805.993 | 2702208993.341 | 3515677623.163 |
| 6.82179371418826e-06 | 1953899676.04 | 2689522838.147 | 3497857499.628 |
| 6.83515027970174e-06 | 1945652521.067 | 2676876298.546 | 3480105050.931 |
| 6.84853299637866e-06 | 1937423449.148 | 2664269425.832 | 3462420220.651 |
| 6.86194191542105e-06 | 1929212566.812 | 2651702269.353 | 3444802950.335 |
| 6.87537708813119e-06 | 1921019979.05 | 2639174876.526 | 3427253179.522 |
| 6.88883856591182e-06 | 1912845789.319 | 2626687292.854 | 3409770845.762 |
| 6.9023264002663e-06 | 1904690099.552 | 2614239561.94 | 3392355884.636 |
| 6.91584064279886e-06 | 1896553010.165 | 2601831725.498 | 3375008229.78 |
| 6.92938134521475e-06 | 1888434620.061 | 2589463823.373 | 3357727812.905 |
| 6.94294855932045e-06 | 1880335026.642 | 2577135893.55 | 3340514563.82 |
| 6.95654233702388e-06 | 1872254325.81 | 2564847972.171 | 3323368410.449 |
| 6.97016273033459e-06 | 1864192611.981 | 2552600093.553 | 3306289278.854 |
| 6.98380979136398e-06 | 1856149978.088 | 2540392290.194 | 3289277093.258 |
| 6.99748357232544e-06 | 1848126515.587 | 2528224592.795 | 3272331776.062 |
| 7.01118412553462e-06 | 1840122314.47 | 2516097030.272 | 3255453247.868 |
| 7.02491150340961e-06 | 1832137463.268 | 2504009629.769 | 3238641427.498 |
| 7.03866575847108e-06 | 1824172049.058 | 2491962416.673 | 3221896232.016 |
| 7.0524469433426e-06 | 1816226157.473 | 2479955414.63 | 3205217576.747 |
| 7.06625511075072e-06 | 1808299872.708 | 2467988645.556 | 3188605375.299 |
| 7.08009031352524e-06 | 1800393277.529 | 2456062129.655 | 3172059539.58 |
| 7.09395260459941e-06 | 1792506453.279 | 2444175885.43 | 3155579979.821 |
| 7.1078420370101e-06 | 1784639479.885 | 2432329929.701 | 3139166604.596 |
| 7.12175866389804e-06 | 1776792435.867 | 2420524277.615 | 3122819320.839 |
| 7.13570253850799e-06 | 1768965398.347 | 2408758942.661 | 3106538033.865 |
| 7.14967371418897e-06 | 1761158443.053 | 2397033936.687 | 3090322647.393 |
| 7.16367224439445e-06 | 1753371644.329 | 2385349269.913 | 3074173063.56 |
| 7.17769818268256e-06 | 1745605075.143 | 2373704950.942 | 3058089182.945 |
| 7.19175158271629e-06 | 1737858807.095 | 2362100986.778 | 3042070904.585 |
| 7.20583249826369e-06 | 1730132910.422 | 2350537382.838 | 3026118125.996 |
| 7.2199409831981e-06 | 1722427454.008 | 2339014142.965 | 3010230743.193 |
| 7.23407709149833e-06 | 1714742505.394 | 2327531269.446 | 2994408650.706 |
| 7.24824087724888e-06 | 1707078130.78 | 2316088763.021 | 2978651741.604 |
| 7.26243239464014e-06 | 1699434395.038 | 2304686622.9 | 2962959907.507 |
| 7.27665169796861e-06 | 1691811361.719 | 2293324846.775 | 2947333038.61 |
| 7.29089884163709e-06 | 1684209093.057 | 2282003430.836 | 2931771023.702 |
| 7.30517388015489e-06 | 1676627649.984 | 2270722369.782 | 2916273750.179 |
| 7.31947686813807e-06 | 1669067092.131 | 2259481656.838 | 2900841104.068 |
| 7.33380786030958e-06 | 1661527477.839 | 2248281283.764 | 2885472970.045 |
| 7.34816691149957e-06 | 1654008864.167 | 2237121240.874 | 2870169231.447 |
| 7.3625540766455e-06 | 1646511306.902 | 2226001517.047 | 2854929770.3 |
| 7.37696941079241e-06 | 1639034860.56 | 2214922099.739 | 2839754467.327 |
| 7.39141296909311e-06 | 1631579578.404 | 2203882974.999 | 2824643201.974 |
| 7.4058848068084e-06 | 1624145512.444 | 2192884127.481 | 2809595852.423 |
| 7.42038497930728e-06 | 1616732713.446 | 2181925540.459 | 2794612295.611 |
| 7.43491354206714e-06 | 1609341230.946 | 2171007195.84 | 2779692407.247 |
| 7.44947055067401e-06 | 1601971113.251 | 2160129074.174 | 2764836061.832 |
| 7.46405606082275e-06 | 1594622407.45 | 2149291154.672 | 2750043132.672 |
| 7.47867012831725e-06 | 1587295159.422 | 2138493415.218 | 2735313491.902 |
| 7.49331280907069e-06 | 1579989413.846 | 2127735832.38 | 2720647010.494 |
| 7.50798415910568e-06 | 1572705214.205 | 2117018381.424 | 2706043558.282 |
| 7.52268423455457e-06 | 1565442602.796 | 2106341036.33 | 2691503003.975 |
| 7.53741309165958e-06 | 1558201620.74 | 2095703769.801 | 2677025215.175 |
| 7.55217078677305e-06 | 1550982307.987 | 2085106553.279 | 2662610058.395 |
| 7.56695737635766e-06 | 1543784703.324 | 2074549356.955 | 2648257399.071 |
| 7.58177291698664e-06 | 1536608844.388 | 2064032149.786 | 2633967101.586 |
| 7.596617465344e-06 | 1529454767.667 | 2053554899.504 | 2619739029.277 |
| 7.61149107822468e-06 | 1522322508.515 | 2043117572.63 | 2605573044.461 |
| 7.6263938125349e-06 | 1515212101.154 | 2032720134.488 | 2591469008.444 |
| 7.64132572529223e-06 | 1508123578.685 | 2022362549.217 | 2577426781.542 |
| 7.65628687362591e-06 | 1501056973.097 | 2012044779.782 | 2563446223.092 |
| 7.67127731477704e-06 | 1494012315.275 | 2001766787.989 | 2549527191.474 |
| 7.68629710609876e-06 | 1486989635.005 | 1991528534.498 | 2535669544.119 |
| 7.70134630505654e-06 | 1479988960.984 | 1981329978.831 | 2521873137.534 |
| 7.71642496922834e-06 | 1473010320.829 | 1971171079.391 | 2508137827.309 |
| 7.73153315630486e-06 | 1466053741.085 | 1961051793.467 | 2494463468.139 |
| 7.74667092408977e-06 | 1459119247.232 | 1950972077.254 | 2480849913.833 |
| 7.76183833049988e-06 | 1452206863.693 | 1940931885.859 | 2467297017.337 |
| 7.77703543356542e-06 | 1445316613.841 | 1930931173.317 | 2453804630.741 |
| 7.79226229143025e-06 | 1438448520.011 | 1920969892.602 | 2440372605.302 |
| 7.80751896235205e-06 | 1431602603.504 | 1911047995.637 | 2427000791.45 |
| 7.82280550470257e-06 | 1424778884.598 | 1901165433.312 | 2413689038.811 |
| 7.83812197696785e-06 | 1417977382.552 | 1891322155.487 | 2400437196.219 |
| 7.85346843774845e-06 | 1411198115.619 | 1881518111.014 | 2387245111.727 |
| 7.86884494575964e-06 | 1404441101.051 | 1871753247.741 | 2374112632.627 |
| 7.88425155983167e-06 | 1397706355.106 | 1862027512.528 | 2361039605.462 |
| 7.89968833890997e-06 | 1390993893.058 | 1852340851.255 | 2348025876.038 |
| 7.9151553420554e-06 | 1384303729.207 | 1842693208.84 | 2335071289.442 |
| 7.93065262844442e-06 | 1377635876.882 | 1833084529.244 | 2322175690.056 |
| 7.94618025736938e-06 | 1370990348.451 | 1823514755.487 | 2309338921.566 |
| 7.96173828823871e-06 | 1364367155.331 | 1813983829.657 | 2296560826.982 |
| 7.97732678057716e-06 | 1357766307.993 | 1804491692.923 | 2283841248.649 |
| 7.99294579402602e-06 | 1351187815.97 | 1795038285.546 | 2271180028.259 |
| 8.00859538834337e-06 | 1344631687.87 | 1785623546.89 | 2258577006.868 |
| 8.02427562340426e-06 | 1338097931.374 | 1776247415.433 | 2246032024.907 |
| 8.03998655920101e-06 | 1331586553.255 | 1766909828.78 | 2233544922.198 |
| 8.05572825584338e-06 | 1325097559.378 | 1757610723.672 | 2221115537.962 |
| 8.0715007735588e-06 | 1318630954.709 | 1748350035.998 | 2208743710.84 |
| 8.08730417269267e-06 | 1312186743.327 | 1739127700.807 | 2196429278.896 |
| 8.1031385137085e-06 | 1305764928.427 | 1729943652.317 | 2184172079.642 |
| 8.11900385718819e-06 | 1299365512.33 | 1720797823.928 | 2171971950.039 |
| 8.13490026383227e-06 | 1292988496.49 | 1711690148.231 | 2159828726.518 |
| 8.15082779446012e-06 | 1286633881.503 | 1702620557.021 | 2147742244.988 |
| 8.16678651001017e-06 | 1280301667.113 | 1693588981.305 | 2135712340.853 |
| 8.1827764715402e-06 | 1273991852.221 | 1684595351.316 | 2123738849.02 |
| 8.19879774022749e-06 | 1267704434.891 | 1675639596.519 | 2111821603.911 |
| 8.21485037736916e-06 | 1261439412.361 | 1666721645.627 | 2099960439.482 |
| 8.2309344443823e-06 | 1255196781.045 | 1657841426.608 | 2088155189.226 |
| 8.24705000280427e-06 | 1248976536.548 | 1648998866.695 | 2076405686.192 |
| 8.26319711429291e-06 | 1242778673.666 | 1640193892.4 | 2064711762.993 |
| 8.27937584062677e-06 | 1236603186.399 | 1631426429.521 | 2053073251.82 |
| 8.29558624370538e-06 | 1230450067.955 | 1622696403.152 | 2041489984.452 |
| 8.31182838554945e-06 | 1224319310.762 | 1614003737.697 | 2029961792.271 |
| 8.32810232830113e-06 | 1218210906.47 | 1605348356.874 | 2018488506.267 |
| 8.34440813422423e-06 | 1212124845.962 | 1596730183.732 | 2007069957.056 |
| 8.36074586570448e-06 | 1206061119.359 | 1588149140.656 | 1995705974.89 |
| 8.37711558524974e-06 | 1200019716.032 | 1579605149.379 | 1984396389.664 |
| 8.39351735549027e-06 | 1194000624.604 | 1571098130.991 | 1973141030.931 |
| 8.40995123917897e-06 | 1188003832.96 | 1562628005.95 | 1961939727.914 |
| 8.42641729919156e-06 | 1182029328.253 | 1554194694.091 | 1950792309.514 |
| 8.4429155985269e-06 | 1176077096.915 | 1545798114.633 | 1939698604.321 |
| 8.4594462003072e-06 | 1170147124.659 | 1537438186.196 | 1928658440.626 |
| 8.47600916777823e-06 | 1164239396.489 | 1529114826.803 | 1917671646.433 |
| 8.49260456430963e-06 | 1158353896.709 | 1520827953.892 | 1906738049.466 |
| 8.50923245339508e-06 | 1152490608.926 | 1512577484.327 | 1895857477.183 |
| 8.52589289865259e-06 | 1146649516.06 | 1504363334.406 | 1885029756.782 |
| 8.54258596382473e-06 | 1140830600.35 | 1496185419.87 | 1874254715.217 |
| 8.55931171277887e-06 | 1135033843.365 | 1488043655.914 | 1863532179.204 |
| 8.57607020950743e-06 | 1129259226.002 | 1479937957.193 | 1852861975.231 |
| 8.59286151812811e-06 | 1123506728.504 | 1471868237.835 | 1842243929.571 |
| 8.60968570288416e-06 | 1117776330.459 | 1463834411.447 | 1831677868.289 |
| 8.62654282814463e-06 | 1112068010.81 | 1455836391.125 | 1821163617.253 |
| 8.64343295840456e-06 | 1106381747.862 | 1447874089.464 | 1810701002.144 |
| 8.66035615828529e-06 | 1100717519.29 | 1439947418.564 | 1800289848.464 |
| 8.6773124925347e-06 | 1095075302.142 | 1432056290.044 | 1789929981.549 |
| 8.69430202602741e-06 | 1089455072.852 | 1424200615.044 | 1779621226.573 |
| 8.71132482376507e-06 | 1083856807.24 | 1416380304.239 | 1769363408.563 |
| 8.72838095087661e-06 | 1078280480.524 | 1408595267.846 | 1759156352.405 |
| 8.74547047261846e-06 | 1072726067.324 | 1400845415.632 | 1748999882.854 |
| 8.76259345437484e-06 | 1067193541.671 | 1393130656.921 | 1738893824.541 |
| 8.77974996165796e-06 | 1061682877.011 | 1385450900.608 | 1728838001.986 |
| 8.79694006010832e-06 | 1056194046.214 | 1377806055.16 | 1718832239.605 |
| 8.81416381549492e-06 | 1050727021.58 | 1370196028.63 | 1708876361.717 |
| 8.83142129371556e-06 | 1045281774.845 | 1362620728.662 | 1698970192.554 |
| 8.84871256079703e-06 | 1039858277.188 | 1355080062.503 | 1689113556.273 |
| 8.86603768289541e-06 | 1034456499.237 | 1347573937.004 | 1679306276.958 |
| 8.88339672629632e-06 | 1029076411.078 | 1340102258.637 | 1669548178.634 |
| 8.90078975741515e-06 | 1023717982.258 | 1332664933.496 | 1659839085.271 |
| 8.91821684279732e-06 | 1018381181.794 | 1325261867.309 | 1650178820.796 |
| 8.93567804911855e-06 | 1013065978.178 | 1317892965.441 | 1640567209.101 |
| 8.9531734431851e-06 | 1007772339.384 | 1310558132.911 | 1631004074.047 |
| 8.97070309193405e-06 | 1002500232.874 | 1303257274.388 | 1621489239.477 |
| 8.98826706243352e-06 | 997249625.607 | 1295990294.209 | 1612022529.22 |
| 9.00586542188295e-06 | 992020484.04 | 1288757096.38 | 1602603767.102 |
| 9.02349823761334e-06 | 986812774.139 | 1281557584.586 | 1593232776.951 |
| 9.04116557708754e-06 | 981626461.382 | 1274391662.2 | 1583909382.608 |
| 9.05886750790047e-06 | 976461510.769 | 1267259232.286 | 1574633407.93 |
| 9.07660409777941e-06 | 971317886.825 | 1260160197.612 | 1565404676.802 |
| 9.09437541458423e-06 | 966195553.605 | 1253094460.653 | 1556223013.143 |
| 9.11218152630768e-06 | 961094474.705 | 1246061923.601 | 1547088240.911 |
| 9.13002250107562e-06 | 956014613.265 | 1239062488.368 | 1538000184.113 |
| 9.14789840714731e-06 | 950955931.972 | 1232096056.6 | 1528958666.813 |
| 9.16580931291563e-06 | 945918393.074 | 1225162529.679 | 1519963513.135 |
| 9.18375528690741e-06 | 940901958.378 | 1218261808.729 | 1511014547.273 |
| 9.20173639778361e-06 | 935906589.26 | 1211393794.629 | 1502111593.499 |
| 9.21975271433966e-06 | 930932246.67 | 1204558388.013 | 1493254476.168 |
| 9.23780430550565e-06 | 925978891.138 | 1197755489.282 | 1484443019.724 |
| 9.25589124034665e-06 | 921046482.782 | 1190984998.607 | 1475677048.708 |
| 9.27401358806295e-06 | 916134981.307 | 1184246815.94 | 1466956387.765 |
| 9.29217141799034e-06 | 911244346.018 | 1177540841.017 | 1458280861.65 |
| 9.31036479960034e-06 | 906374535.825 | 1170866973.365 | 1449650295.235 |
| 9.32859380250051e-06 | 901525509.244 | 1164225112.311 | 1441064513.515 |
| 9.3468584964347e-06 | 896697224.405 | 1157615156.985 | 1432523341.613 |
| 9.3651589512833e-06 | 891889639.061 | 1151037006.331 | 1424026604.789 |
| 9.38349523706351e-06 | 887102710.588 | 1144490559.108 | 1415574128.443 |
| 9.40186742392966e-06 | 882336395.995 | 1137975713.902 | 1407165738.125 |
| 9.42027558217338e-06 | 877590651.926 | 1131492369.126 | 1398801259.538 |
| 9.43871978222398e-06 | 872865434.669 | 1125040423.034 | 1390480518.544 |
| 9.45720009464863e-06 | 868160700.158 | 1118619773.717 | 1382203341.172 |
| 9.47571659015269e-06 | 863476403.983 | 1112230319.121 | 1373969553.622 |
| 9.49426933957992e-06 | 858812501.389 | 1105871957.042 | 1365778982.271 |
| 9.51285841391283e-06 | 854168947.287 | 1099544585.14 | 1357631453.679 |
| 9.53148388427287e-06 | 849545696.256 | 1093248100.941 | 1349526794.596 |
| 9.55014582192078e-06 | 844942702.55 | 1086982401.844 | 1341464831.965 |
| 9.56884429825678e-06 | 840359920.104 | 1080747385.125 | 1333445392.927 |
| 9.58757938482092e-06 | 835797302.536 | 1074542947.946 | 1325468304.832 |
| 9.60635115329331e-06 | 831254803.154 | 1068368987.359 | 1317533395.236 |
| 9.6251596754944e-06 | 826732374.962 | 1062225400.311 | 1309640491.912 |
| 9.64400502338525e-06 | 822229970.665 | 1056112083.652 | 1301789422.857 |
| 9.66288726906784e-06 | 817747542.672 | 1050028934.136 | 1293980016.288 |
| 9.6818064847853e-06 | 813285043.103 | 1043975848.432 | 1286212100.658 |
| 9.70076274292222e-06 | 808842423.794 | 1037952723.126 | 1278485504.653 |
| 9.7197561160049e-06 | 804419636.301 | 1031959454.728 | 1270800057.201 |
| 9.73878667670164e-06 | 800016631.904 | 1025995939.675 | 1263155587.475 |
| 9.75785449782304e-06 | 795633361.615 | 1020062074.338 | 1255551924.899 |
| 9.77695965232224e-06 | 791269776.18 | 1014157755.03 | 1247988899.152 |
| 9.79610221329523e-06 | 786925826.086 | 1008282878.006 | 1240466340.172 |
| 9.8152822539811e-06 | 782601461.564 | 1002437339.469 | 1232984078.164 |
| 9.83449984776233e-06 | 778296632.594 | 996621035.58 | 1225541943.599 |
| 9.85375506816511e-06 | 774011288.911 | 990833862.458 | 1218139767.222 |
| 9.87304798885957e-06 | 769745380.008 | 985075716.185 | 1210777380.058 |
| 9.89237868366008e-06 | 765498855.143 | 979346492.816 | 1203454613.412 |
| 9.91174722652554e-06 | 761271663.34 | 973646088.377 | 1196171298.876 |
| 9.93115369155963e-06 | 757063753.397 | 967974398.875 | 1188927268.332 |
| 9.95059815301116e-06 | 752875073.89 | 962331320.301 | 1181722353.958 |
| 9.97008068527429e-06 | 748705573.175 | 956716748.634 | 1174556388.231 |
| 9.98960136288884e-06 | 744555199.395 | 951130579.846 | 1167429203.929 |
| 1.00091602605406e-05 | 740423900.484 | 945572709.908 | 1160340634.139 |
| 1.00287574530615e-05 | 736311624.172 | 940043034.794 | 1153290512.258 |
| 1.00483930154301e-05 | 732218317.986 | 934541450.484 | 1146278671.999 |
| 1.00680670227717e-05 | 728143929.258 | 929067852.969 | 1139304947.39 |
| 1.00877795503587e-05 | 724088405.13 | 923622138.259 | 1132369172.785 |
| 1.01075306736109e-05 | 720051692.554 | 918204202.38 | 1125471182.861 |
| 1.01273204680957e-05 | 716033738.3 | 912813941.387 | 1118610812.628 |
| 1.01471490095286e-05 | 712034488.957 | 907451251.361 | 1111787897.425 |
| 1.01670163737731e-05 | 708053890.942 | 902116028.419 | 1105002272.93 |
| 1.01869226368415e-05 | 704091890.499 | 896808168.712 | 1098253775.161 |
| 1.02068678748948e-05 | 700148433.706 | 891527568.436 | 1091542240.48 |
| 1.02268521642431e-05 | 696223466.478 | 886274123.83 | 1084867505.593 |
| 1.02468755813459e-05 | 692316934.572 | 881047731.185 | 1078229407.56 |
| 1.02669382028125e-05 | 688428783.591 | 875848286.844 | 1071627783.79 |
| 1.0287040105402e-05 | 684558958.985 | 870675687.21 | 1065062472.053 |
| 1.03071813660241e-05 | 680707406.06 | 865529828.745 | 1058533310.476 |
| 1.03273620617389e-05 | 676874069.978 | 860410607.977 | 1052040137.549 |
| 1.03475822697572e-05 | 673058895.762 | 855317921.505 | 1045582792.128 |
| 1.03678420674413e-05 | 669261828.3 | 850251666 | 1039161113.438 |
| 1.03881415323048e-05 | 665482812.35 | 845211738.21 | 1032774941.076 |
| 1.04084807420131e-05 | 661721792.542 | 840198034.963 | 1026424115.011 |
| 1.04288597743837e-05 | 657978713.38 | 835210453.172 | 1020108475.593 |
| 1.04492787073863e-05 | 654253519.252 | 830248889.838 | 1013827863.549 |
| 1.04697376191434e-05 | 650546154.426 | 825313242.052 | 1007582119.991 |
| 1.04902365879305e-05 | 646856563.061 | 820403407.001 | 1001371086.416 |
| 1.05107756921762e-05 | 643184689.204 | 815519281.971 | 995194604.708 |
| 1.05313550104629e-05 | 639530476.797 | 810660764.347 | 989052517.143 |
| 1.05519746215265e-05 | 635893869.681 | 805827751.622 | 982944666.39 |
| 1.05726346042575e-05 | 632274811.6 | 801020141.396 | 976870895.513 |
| 1.05933350377004e-05 | 628673246.199 | 796237831.382 | 970831047.973 |
| 1.06140760010548e-05 | 625089117.036 | 791480719.407 | 964824967.636 |
| 1.06348575736753e-05 | 621522367.578 | 786748703.416 | 958852498.765 |
| 1.06556798350717e-05 | 617972941.208 | 782041681.477 | 952913486.032 |
| 1.06765428649097e-05 | 614440781.23 | 777359551.781 | 947007774.516 |
| 1.06974467430109e-05 | 610925830.868 | 772702212.648 | 941135209.704 |
| 1.07183915493531e-05 | 607428033.271 | 768069562.527 | 935295637.496 |
| 1.07393773640708e-05 | 603947331.518 | 763461500.003 | 929488904.205 |
| 1.07604042674553e-05 | 600483668.619 | 758877923.796 | 923714856.56 |
| 1.07814723399552e-05 | 597036987.519 | 754318732.767 | 917973341.709 |
| 1.08025816621765e-05 | 593607231.104 | 749783825.918 | 912264207.218 |
| 1.08237323148832e-05 | 590194342.198 | 745273102.398 | 906587301.077 |
| 1.08449243789973e-05 | 586798263.571 | 740786461.504 | 900942471.698 |
| 1.08661579355993e-05 | 583418937.94 | 736323802.683 | 895329567.919 |
| 1.08874330659282e-05 | 580056307.975 | 731885025.536 | 889748439.006 |
| 1.09087498513825e-05 | 576710316.297 | 727470029.823 | 884198934.653 |
| 1.09301083735198e-05 | 573380905.485 | 723078715.459 | 878680904.985 |
| 1.09515087140573e-05 | 570068018.078 | 718710982.524 | 873194200.561 |
| 1.09729509548724e-05 | 566771596.578 | 714366731.261 | 867738672.372 |
| 1.09944351780028e-05 | 563491583.451 | 710045862.081 | 862314171.847 |
| 1.10159614656467e-05 | 560227921.133 | 705748275.564 | 856920550.851 |
| 1.10375299001633e-05 | 556980552.031 | 701473872.46 | 851557661.687 |
| 1.1059140564073e-05 | 553749418.525 | 697222553.697 | 846225357.101 |
| 1.10807935400578e-05 | 550534462.975 | 692994220.377 | 840923490.278 |
| 1.11024889109617e-05 | 547335627.716 | 688788773.782 | 835651914.848 |
| 1.11242267597908e-05 | 544152855.071 | 684606115.377 | 830410484.884 |
| 1.11460071697136e-05 | 540986087.344 | 680446146.809 | 825199054.908 |
| 1.11678302240617e-05 | 537835266.829 | 676308769.911 | 820017479.884 |
| 1.11896960063296e-05 | 534700335.808 | 672193886.706 | 814865615.23 |
| 1.12116046001755e-05 | 531581236.561 | 668101399.406 | 809743316.811 |
| 1.12335560894212e-05 | 528477911.358 | 664031210.417 | 804650440.941 |
| 1.12555505580528e-05 | 525390302.472 | 659983222.339 | 799586844.39 |
| 1.12775880902207e-05 | 522318352.174 | 655957337.969 | 794552384.379 |
| 1.129966877024e-05 | 519262002.74 | 651953460.303 | 789546918.582 |
| 1.13217926825912e-05 | 516221196.451 | 647971492.539 | 784570305.132 |
| 1.13439599119199e-05 | 513195875.597 | 644011338.077 | 779622402.613 |
| 1.13661705430374e-05 | 510185982.478 | 640072900.523 | 774703070.071 |
| 1.13884246609214e-05 | 507191459.408 | 636156083.688 | 769812167.008 |
| 1.14107223507156e-05 | 504212248.717 | 632260791.595 | 764949553.386 |
| 1.14330636977306e-05 | 501248292.751 | 628386928.476 | 760115089.625 |
| 1.1455448787444e-05 | 498299533.878 | 624534398.775 | 755308636.608 |
| 1.14778777055008e-05 | 495365914.489 | 620703107.151 | 750530055.678 |
| 1.15003505377136e-05 | 492447376.998 | 616892958.48 | 745779208.643 |
| 1.15228673700631e-05 | 489543863.847 | 613103857.855 | 741055957.771 |
| 1.15454282886982e-05 | 486655317.509 | 609335710.589 | 736360165.796 |
| 1.15680333799367e-05 | 483781680.486 | 605588422.217 | 731691695.916 |
| 1.15906827302652e-05 | 480922895.314 | 601861898.496 | 727050411.793 |
| 1.16133764263397e-05 | 478078904.568 | 598156045.408 | 722436177.557 |
| 1.16361145549859e-05 | 475249650.857 | 594470769.162 | 717848857.803 |
| 1.16588972031995e-05 | 472435076.832 | 590805976.193 | 713288317.593 |
| 1.16817244581465e-05 | 469635125.187 | 587161573.168 | 708754422.458 |
| 1.17045964071636e-05 | 466849738.659 | 583537466.983 | 704247038.395 |
| 1.17275131377584e-05 | 464078860.031 | 579933564.766 | 699766031.872 |
| 1.17504747376099e-05 | 461322432.135 | 576349773.881 | 695311269.823 |
| 1.17734812945688e-05 | 458580397.853 | 572786001.926 | 690882619.653 |
| 1.17965328966578e-05 | 455852700.121 | 569242156.734 | 686479949.239 |
| 1.18196296320719e-05 | 453139281.926 | 565718146.38 | 682103126.923 |
| 1.18427715891788e-05 | 450440086.312 | 562213879.175 | 677752021.523 |
| 1.18659588565192e-05 | 447755056.384 | 558729263.671 | 673426502.324 |
| 1.18891915228073e-05 | 445084135.302 | 555264208.665 | 669126439.084 |
| 1.19124696769306e-05 | 442427266.291 | 551818623.193 | 664851702.031 |
| 1.19357934079512e-05 | 439784392.639 | 548392416.539 | 660602161.867 |
| 1.19591628051051e-05 | 437155457.697 | 544985498.231 | 656377689.764 |
| 1.19825779578032e-05 | 434540404.887 | 541597778.044 | 652178157.365 |
| 1.20060389556315e-05 | 431939177.696 | 538229166.003 | 648003436.788 |
| 1.20295458883514e-05 | 429351719.683 | 534879572.378 | 643853400.622 |
| 1.20530988459e-05 | 426777974.48 | 531548907.695 | 639727921.927 |
| 1.20766979183904e-05 | 424217885.792 | 528237082.726 | 635626874.238 |
| 1.21003431961123e-05 | 421671397.4 | 524944008.498 | 631550131.561 |
| 1.21240347695321e-05 | 419138453.16 | 521669596.293 | 627497568.375 |
| 1.21477727292934e-05 | 416618997.01 | 518413757.646 | 623469059.631 |
| 1.21715571662171e-05 | 414112972.967 | 515176404.346 | 619464480.754 |
| 1.21953881713021e-05 | 411620325.13 | 511957448.44 | 615483707.641 |
| 1.22192658357254e-05 | 409140997.681 | 508756802.234 | 611526616.661 |
| 1.22431902508425e-05 | 406674934.887 | 505574378.29 | 607593084.656 |
| 1.22671615081879e-05 | 404222081.102 | 502410089.43 | 603682988.94 |
| 1.2291179699475e-05 | 401782380.769 | 499263848.737 | 599796207.3 |
| 1.23152449165971e-05 | 399355778.419 | 496135569.553 | 595932617.994 |
| 1.23393572516272e-05 | 396942218.673 | 493025165.484 | 592092099.753 |
| 1.23635167968188e-05 | 394541646.248 | 489932550.396 | 588274531.779 |
| 1.23877236446059e-05 | 392154005.95 | 486857638.423 | 584479793.746 |
| 1.24119778876033e-05 | 389779242.685 | 483800343.957 | 580707765.799 |
| 1.24362796186074e-05 | 387417301.451 | 480760581.66 | 576958328.554 |
| 1.24606289305962e-05 | 385068127.346 | 477738266.458 | 573231363.099 |
| 1.24850259167297e-05 | 382731665.569 | 474733313.542 | 569526750.991 |
| 1.25094706703504e-05 | 380407861.415 | 471745638.371 | 565844374.258 |
| 1.25339632849834e-05 | 378096660.286 | 468775156.672 | 562184115.398 |
| 1.25585038543371e-05 | 375798007.682 | 465821784.441 | 558545857.378 |
| 1.25830924723032e-05 | 373511849.21 | 462885437.94 | 554929483.635 |
| 1.26077292329574e-05 | 371238130.583 | 459966033.704 | 551334878.075 |
| 1.26324142305594e-05 | 368976797.619 | 457063488.536 | 547761925.07 |
| 1.26571475595537e-05 | 366727796.244 | 454177719.509 | 544210509.464 |
| 1.26819293145694e-05 | 364491072.495 | 451308643.97 | 540680516.566 |
| 1.27067595904212e-05 | 362266572.517 | 448456179.535 | 537171832.152 |
| 1.27316384821093e-05 | 360054242.567 | 445620244.094 | 533684342.466 |
| 1.27565660848198e-05 | 357854029.016 | 442800755.807 | 530217934.217 |
| 1.27815424939253e-05 | 355665878.346 | 439997633.11 | 526772494.581 |
| 1.28065678049852e-05 | 353489737.155 | 437210794.712 | 523347911.198 |
| 1.28316421137457e-05 | 351325552.156 | 434440159.594 | 519944072.173 |
| 1.28567655161408e-05 | 349173270.181 | 431685647.014 | 516560866.075 |
| 1.28819381082921e-05 | 347032838.177 | 428947176.503 | 513198181.938 |
| 1.29071599865096e-05 | 344904203.21 | 426224667.868 | 509855909.257 |
| 1.29324312472917e-05 | 342787312.469 | 423518041.19 | 506533937.989 |
| 1.29577519873258e-05 | 340682113.259 | 420827216.829 | 503232158.555 |
| 1.29831223034886e-05 | 338588553.009 | 418152115.417 | 499950461.836 |
| 1.30085422928464e-05 | 336506579.273 | 415492657.866 | 496688739.173 |
| 1.30340120526558e-05 | 334436139.724 | 412848765.363 | 493446882.367 |
| 1.30595316803635e-05 | 332377182.163 | 410220359.371 | 490224783.679 |
| 1.30851012736072e-05 | 330329654.515 | 407607361.633 | 487022335.827 |
| 1.31107209302157e-05 | 328293504.831 | 405009694.168 | 483839431.989 |
| 1.31363907482094e-05 | 326268681.29 | 402427279.27 | 480675965.797 |
| 1.31621108258005e-05 | 324255132.198 | 399860039.517 | 477531831.342 |
| 1.31878812613935e-05 | 322252805.99 | 397307897.758 | 474406923.169 |
| 1.32137021535858e-05 | 320261651.231 | 394770777.126 | 471301136.28 |
| 1.32395736011675e-05 | 318281616.616 | 392248601.03 | 468214366.127 |
| 1.32654957031224e-05 | 316312650.972 | 389741293.156 | 465146508.62 |
| 1.3291468558628e-05 | 314354703.257 | 387248777.472 | 462097460.119 |
| 1.3317492267056e-05 | 312407722.562 | 384770978.221 | 459067117.435 |
| 1.33435669279726e-05 | 310471658.112 | 382307819.929 | 456055377.832 |
| 1.3369692641139e-05 | 308546459.264 | 379859227.396 | 453062139.022 |
| 1.33958695065117e-05 | 306632075.513 | 377425125.706 | 450087299.168 |
| 1.34220976242429e-05 | 304728456.488 | 375005440.219 | 447130756.881 |
| 1.3448377094681e-05 | 302835551.953 | 372600096.574 | 444192411.218 |
| 1.34747080183707e-05 | 300953311.81 | 370209020.691 | 441272161.685 |
| 1.35010904960536e-05 | 299081686.1 | 367832138.766 | 438369908.231 |
| 1.35275246286688e-05 | 297220625 | 365469377.278 | 435485551.253 |
| 1.35540105173526e-05 | 295370078.827 | 363120662.982 | 432618991.59 |
| 1.35805482634397e-05 | 293529998.036 | 360785922.913 | 429770130.523 |
| 1.3607137968463e-05 | 291700333.224 | 358465084.386 | 426938869.778 |
| 1.36337797341541e-05 | 289881035.127 | 356158074.992 | 424125111.521 |
| 1.36604736624441e-05 | 288072054.623 | 353864822.604 | 421328758.357 |
| 1.36872198554634e-05 | 286273342.73 | 351585255.373 | 418549713.331 |
| 1.37140184155426e-05 | 284484850.612 | 349319301.727 | 415787879.928 |
| 1.37408694452123e-05 | 282706529.571 | 347066890.375 | 413043162.067 |
| 1.37677730472042e-05 | 280938331.056 | 344827950.302 | 410315464.107 |
| 1.37947293244509e-05 | 279180206.658 | 342602410.774 | 407604690.84 |
| 1.38217383800868e-05 | 277432108.112 | 340390201.332 | 404910747.493 |
| 1.38488003174479e-05 | 275693987.299 | 338191251.798 | 402233539.726 |
| 1.38759152400728e-05 | 273965796.245 | 336005492.269 | 399572973.632 |
| 1.39030832517027e-05 | 272247487.12 | 333832853.123 | 396928955.735 |
| 1.39303044562818e-05 | 270539012.241 | 331673265.012 | 394301392.989 |
| 1.39575789579582e-05 | 268840324.073 | 329526658.868 | 391690192.778 |
| 1.39849068610834e-05 | 267151375.227 | 327392965.898 | 389095262.913 |
| 1.40122882702136e-05 | 265472118.459 | 325272117.587 | 386516511.634 |
| 1.40397232901096e-05 | 263802506.676 | 323164045.696 | 383953847.604 |
| 1.40672120257372e-05 | 262142492.931 | 321068682.263 | 381407179.914 |
| 1.40947545822679e-05 | 260492030.427 | 318985959.602 | 378876418.078 |
| 1.41223510650791e-05 | 258851072.515 | 316915810.303 | 376361472.032 |
| 1.41500015797542e-05 | 257219572.695 | 314858167.229 | 373862252.133 |
| 1.41777062320838e-05 | 255597484.616 | 312812963.521 | 371378669.162 |
| 1.42054651280654e-05 | 253984762.079 | 310780132.596 | 368910634.316 |
| 1.4233278373904e-05 | 252381359.031 | 308759608.142 | 366458059.211 |
| 1.42611460760125e-05 | 250787229.574 | 306751324.124 | 364020855.883 |
| 1.42890683410123e-05 | 249202327.959 | 304755214.779 | 361598936.779 |
| 1.43170452757335e-05 | 247626608.586 | 302771214.621 | 359192214.767 |
| 1.43450769872154e-05 | 246060026.009 | 300799258.433 | 356800603.123 |
| 1.43731635827067e-05 | 244502534.932 | 298839281.275 | 354424015.541 |
| 1.44013051696663e-05 | 242954090.212 | 296891218.477 | 352062366.122 |
| 1.44295018557635e-05 | 241414646.855 | 294955005.642 | 349715569.381 |
| 1.44577537488781e-05 | 239884160.024 | 293030578.645 | 347383540.239 |
| 1.44860609571016e-05 | 238362585.03 | 291117873.632 | 345066194.028 |
| 1.45144235887366e-05 | 236849877.339 | 289216827.02 | 342763446.485 |
| 1.45428417522982e-05 | 235345992.57 | 287327375.498 | 340475213.752 |
| 1.45713155565138e-05 | 233850886.493 | 285449456.025 | 338201412.379 |
| 1.45998451103236e-05 | 232364515.033 | 283583005.827 | 335941959.315 |
| 1.46284305228812e-05 | 230886834.268 | 281727962.403 | 333696771.913 |
| 1.46570719035539e-05 | 229417800.428 | 279884263.52 | 331465767.928 |
| 1.4685769361923e-05 | 227957369.9 | 278051847.212 | 329248865.513 |
| 1.47145230077846e-05 | 226505499.222 | 276230651.782 | 327045983.221 |
| 1.47433329511495e-05 | 225062145.087 | 274420615.802 | 324857040 |
| 1.47721993022442e-05 | 223627264.341 | 272621678.108 | 322681955.196 |
| 1.48011221715107e-05 | 222200813.986 | 270833777.806 | 320520648.549 |
| 1.48301016696075e-05 | 220782751.177 | 269056854.267 | 318373040.193 |
| 1.48591379074096e-05 | 219373033.223 | 267290847.126 | 316239050.655 |
| 1.48882309960091e-05 | 217971617.589 | 265535696.285 | 314118600.851 |
| 1.49173810467156e-05 | 216578461.893 | 263791341.911 | 312011612.089 |
| 1.49465881710568e-05 | 215193523.908 | 262057724.433 | 309918006.065 |
| 1.49758524807785e-05 | 213816761.563 | 260334784.547 | 307837704.862 |
| 1.50051740878455e-05 | 212448132.94 | 258622463.21 | 305770630.95 |
| 1.50345531044418e-05 | 211087596.276 | 256920701.641 | 303716707.182 |
| 1.5063989642971e-05 | 209735109.964 | 255229441.322 | 301675856.797 |
| 1.50934838160566e-05 | 208390632.55 | 253548623.997 | 299648003.416 |
| 1.5123035736543e-05 | 207054122.737 | 251878191.671 | 297633071.039 |
| 1.51526455174951e-05 | 205725539.381 | 250218086.608 | 295630984.049 |
| 1.51823132721996e-05 | 204404841.495 | 248568251.333 | 293641667.204 |
| 1.52120391141647e-05 | 203091988.243 | 246928628.631 | 291665045.644 |
| 1.5241823157121e-05 | 201786938.949 | 245299161.544 | 289701044.881 |
| 1.52716655150216e-05 | 200489653.087 | 243679793.374 | 287749590.803 |
| 1.53015663020429e-05 | 199200090.289 | 242070467.678 | 285810609.672 |
| 1.53315256325848e-05 | 197918210.341 | 240471128.274 | 283884028.122 |
| 1.53615436212712e-05 | 196643973.184 | 238881719.232 | 281969773.159 |
| 1.53916203829504e-05 | 195377338.912 | 237302184.881 | 280067772.155 |
| 1.54217560326954e-05 | 194118267.775 | 235732469.804 | 278177952.856 |
| 1.54519506858048e-05 | 192866720.179 | 234172518.838 | 276300243.37 |
| 1.54822044578027e-05 | 191622656.681 | 232622277.076 | 274434572.175 |
| 1.55125174644396e-05 | 190386037.996 | 231081689.861 | 272580868.109 |
| 1.55428898216925e-05 | 189156824.991 | 229550702.793 | 270739060.377 |
| 1.55733216457655e-05 | 187934978.689 | 228029261.721 | 268909078.545 |
| 1.56038130530902e-05 | 186720460.266 | 226517312.746 | 267090852.539 |
| 1.56343641603262e-05 | 185513231.052 | 225014802.221 | 265284312.644 |
| 1.56649750843614e-05 | 184313252.532 | 223521676.748 | 263489389.505 |
| 1.56956459423128e-05 | 183120486.344 | 222037883.179 | 261706014.121 |
| 1.57263768515265e-05 | 181934894.28 | 220563368.616 | 259934117.849 |
| 1.57571679295783e-05 | 180756438.286 | 219098080.407 | 258173632.4 |
| 1.57880192942745e-05 | 179585080.461 | 217641966.149 | 256424489.835 |
| 1.58189310636517e-05 | 178420783.057 | 216194973.686 | 254686622.569 |
| 1.58499033559779e-05 | 177263508.482 | 214757051.108 | 252959963.369 |
| 1.58809362897526e-05 | 176113219.292 | 213328146.751 | 251244445.346 |
| 1.59120299837071e-05 | 174969878.201 | 211908209.195 | 249540001.963 |
| 1.59431845568053e-05 | 173833448.073 | 210497187.266 | 247846567.027 |
| 1.59744001282442e-05 | 172703891.925 | 209095030.032 | 246164074.692 |
| 1.60056768174539e-05 | 171581172.927 | 207701686.805 | 244492459.454 |
| 1.60370147440986e-05 | 170465254.4 | 206317107.137 | 242831656.152 |
| 1.60684140280765e-05 | 169356099.82 | 204941240.825 | 241181599.966 |
| 1.60998747895207e-05 | 168253672.812 | 203574037.904 | 239542226.416 |
| 1.61313971487996e-05 | 167157937.153 | 202215448.651 | 237913471.361 |
| 1.61629812265171e-05 | 166068856.773 | 200865423.581 | 236295270.997 |
| 1.61946271435135e-05 | 164986395.752 | 199523913.449 | 234687561.856 |
| 1.62263350208653e-05 | 163910518.323 | 198190869.247 | 233090280.803 |
| 1.62581049798863e-05 | 162841188.866 | 196866242.204 | 231503365.038 |
| 1.6289937142128e-05 | 161778371.917 | 195549983.788 | 229926752.093 |
| 1.63218316293795e-05 | 160722032.158 | 194242045.7 | 228360379.831 |
| 1.63537885636685e-05 | 159672134.424 | 192942379.879 | 226804186.443 |
| 1.63858080672619e-05 | 158628643.698 | 191650938.496 | 225258110.449 |
| 1.64178902626655e-05 | 157591525.114 | 190367673.957 | 223722090.695 |
| 1.64500352726253e-05 | 156560743.956 | 189092538.901 | 222196066.354 |
| 1.64822432201276e-05 | 155536265.655 | 187825486.198 | 220679976.922 |
| 1.65145142283994e-05 | 154518055.795 | 186566468.953 | 219173762.218 |
| 1.65468484209089e-05 | 153506080.105 | 185315440.497 | 217677362.383 |
| 1.65792459213663e-05 | 152500304.465 | 184072354.396 | 216190717.879 |
| 1.66117068537238e-05 | 151500694.901 | 182837164.442 | 214713769.484 |
| 1.66442313421763e-05 | 150507217.59 | 181609824.658 | 213246458.298 |
| 1.6676819511162e-05 | 149519838.854 | 180390289.291 | 211788725.733 |
| 1.67094714853626e-05 | 148538525.165 | 179178512.821 | 210340513.52 |
| 1.6742187389704e-05 | 147563243.139 | 177974449.949 | 208901763.701 |
| 1.67749673493566e-05 | 146593959.542 | 176778055.606 | 207472418.632 |
| 1.68078114897361e-05 | 145630641.285 | 175589284.944 | 206052420.98 |
| 1.68407199365034e-05 | 144673255.427 | 174408093.343 | 204641713.722 |
| 1.68736928155657e-05 | 143721769.171 | 173234436.404 | 203240240.142 |
| 1.69067302530767e-05 | 142776149.867 | 172068269.951 | 201847943.834 |
| 1.69398323754371e-05 | 141836365.011 | 170909550.031 | 200464768.697 |
| 1.69729993092949e-05 | 140902382.242 | 169758232.911 | 199090658.933 |
| 1.70062311815462e-05 | 139974169.346 | 168614275.079 | 197725559.051 |
| 1.70395281193357e-05 | 139051694.254 | 167477633.244 | 196369413.86 |
| 1.70728902500567e-05 | 138134925.039 | 166348264.331 | 195022168.469 |
| 1.71063177013523e-05 | 137223829.92 | 165226125.485 | 193683768.288 |
| 1.71398106011152e-05 | 136318377.258 | 164111174.07 | 192354159.027 |
| 1.71733690774888e-05 | 135418535.559 | 163003367.663 | 191033286.69 |
| 1.7206993258867e-05 | 134524273.471 | 161902664.06 | 189721097.579 |
| 1.72406832738955e-05 | 133635559.785 | 160809021.27 | 188417538.289 |
| 1.72744392514716e-05 | 132752363.434 | 159722397.519 | 187122555.709 |
| 1.73082613207451e-05 | 131874653.494 | 158642751.243 | 185836097.021 |
| 1.73421496111187e-05 | 131002399.182 | 157570041.095 | 184558109.696 |
| 1.73761042522483e-05 | 130135569.855 | 156504225.936 | 183288541.496 |
| 1.74101253740439e-05 | 129274135.013 | 155445264.842 | 182027340.47 |
| 1.74442131066695e-05 | 128418064.297 | 154393117.097 | 180774454.955 |
| 1.74783675805443e-05 | 127567327.487 | 153347742.196 | 179529833.573 |
| 1.75125889263427e-05 | 126721894.503 | 152309099.842 | 178293425.232 |
| 1.75468772749949e-05 | 125881735.404 | 151277149.948 | 177065179.12 |
| 1.75812327576875e-05 | 125046820.392 | 150251852.633 | 175845044.709 |
| 1.76156555058641e-05 | 124217119.802 | 149233168.223 | 174632971.753 |
| 1.76501456512254e-05 | 123392604.114 | 148221057.25 | 173428910.283 |
| 1.76847033257301e-05 | 122573243.94 | 147215480.452 | 172232810.61 |
| 1.77193286615952e-05 | 121759010.035 | 146216398.77 | 171044623.32 |
| 1.77540217912968e-05 | 120949873.289 | 145223773.35 | 169864299.278 |
| 1.778878284757e-05 | 120145804.728 | 144237565.539 | 168691789.619 |
| 1.78236119634102e-05 | 119346775.518 | 143257736.889 | 167527045.755 |
| 1.78585092720727e-05 | 118552756.959 | 142284249.151 | 166370019.369 |
| 1.78934749070742e-05 | 117763720.487 | 141317064.278 | 165220662.414 |
| 1.79285090021925e-05 | 116979637.675 | 140356144.421 | 164078927.113 |
| 1.79636116914674e-05 | 116200480.23 | 139401451.931 | 162944765.958 |
| 1.79987831092013e-05 | 115426219.994 | 138452949.358 | 161818131.707 |
| 1.80340233899593e-05 | 114656828.945 | 137510599.448 | 160698977.385 |
| 1.80693326685701e-05 | 113892279.194 | 136574365.146 | 159587256.28 |
| 1.81047110801264e-05 | 113132542.984 | 135644209.59 | 158482921.946 |
| 1.81401587599854e-05 | 112377592.695 | 134720096.116 | 157385928.197 |
| 1.81756758437692e-05 | 111627400.838 | 133801988.251 | 156296229.109 |
| 1.82112624673656e-05 | 110881940.055 | 132889849.72 | 155213779.019 |
| 1.82469187669284e-05 | 110141183.123 | 131983644.437 | 154138532.52 |
| 1.82826448788779e-05 | 109405102.949 | 131083336.511 | 153070444.464 |
| 1.83184409399017e-05 | 108673672.572 | 130188890.239 | 152009469.959 |
| 1.83543070869548e-05 | 107946865.163 | 129300270.113 | 150955564.369 |
| 1.83902434572604e-05 | 107224654.022 | 128417440.81 | 149908683.311 |
| 1.84262501883105e-05 | 106507012.58 | 127540367.199 | 148868782.653 |
| 1.84623274178661e-05 | 105793914.397 | 126669014.338 | 147835818.518 |
| 1.84984752839582e-05 | 105085333.163 | 125803347.469 | 146809747.278 |
| 1.85346939248878e-05 | 104381242.698 | 124943332.024 | 145790525.551 |
| 1.85709834792267e-05 | 103681616.948 | 124088933.62 | 144778110.208 |
| 1.86073440858183e-05 | 102986429.991 | 123240118.058 | 143772458.363 |
| 1.86437758837774e-05 | 102295656.029 | 122396851.325 | 142773527.377 |
| 1.86802790124916e-05 | 101609269.394 | 121559099.592 | 141781274.856 |
| 1.87168536116211e-05 | 100927244.543 | 120726829.21 | 140795658.648 |
| 1.87534998210997e-05 | 100249556.061 | 119900006.716 | 139816636.845 |
| 1.87902177811351e-05 | 99576178.66 | 119078598.825 | 138844167.777 |
| 1.88270076322097e-05 | 98907087.174 | 118262572.435 | 137878210.016 |
| 1.88638695150807e-05 | 98242256.567 | 117451894.623 | 136918722.373 |
| 1.8900803570781e-05 | 97581661.925 | 116646532.645 | 135965663.894 |
| 1.89378099406197e-05 | 96925278.458 | 115846453.935 | 135018993.865 |
| 1.89748887661826e-05 | 96273081.504 | 115051626.106 | 134078671.804 |
| 1.90120401893324e-05 | 95625046.519 | 114262016.947 | 133144657.465 |
| 1.90492643522099e-05 | 94981149.088 | 113477594.422 | 132216910.833 |
| 1.90865613972341e-05 | 94341364.914 | 112698326.672 | 131295392.127 |
| 1.91239314671029e-05 | 93705669.826 | 111924182.012 | 130380061.795 |
| 1.91613747047934e-05 | 93074039.773 | 111155128.93 | 129470880.517 |
| 1.91988912535628e-05 | 92446450.827 | 110391136.089 | 128567809.197 |
| 1.92364812569487e-05 | 91822879.178 | 109632172.323 | 127670808.972 |
| 1.92741448587699e-05 | 91203301.142 | 108878206.637 | 126779841.199 |
| 1.93118822031266e-05 | 90587693.15 | 108129208.208 | 125894867.466 |
| 1.93496934344012e-05 | 89976031.757 | 107385146.383 | 125015849.581 |
| 1.93875786972588e-05 | 89368293.635 | 106645990.677 | 124142749.576 |
| 1.94255381366478e-05 | 88764455.577 | 105911710.777 | 123275529.705 |
| 1.94635718978002e-05 | 88164494.491 | 105182276.533 | 122414152.443 |
| 1.95016801262327e-05 | 87568387.408 | 104457657.966 | 121558580.484 |
| 1.95398629677466e-05 | 86976111.474 | 103737825.262 | 120708776.74 |
| 1.95781205684287e-05 | 86387643.952 | 103022748.773 | 119864704.342 |
| 1.9616453074652e-05 | 85802962.223 | 102312399.015 | 119026326.635 |
| 1.9654860633076e-05 | 85222043.786 | 101606746.669 | 118193607.182 |
| 1.96933433906472e-05 | 84644866.252 | 100905762.579 | 117366509.758 |
| 1.97319014946001e-05 | 84071407.352 | 100209417.752 | 116544998.352 |
| 1.97705350924572e-05 | 83501644.929 | 99517683.358 | 115729037.165 |
| 1.98092443320301e-05 | 82935556.943 | 98830530.727 | 114918590.608 |
| 1.98480293614195e-05 | 82373121.467 | 98147931.348 | 114113623.304 |
| 1.98868903290164e-05 | 81814316.688 | 97469856.874 | 113314100.082 |
| 1.9925827383502e-05 | 81259120.909 | 96796279.113 | 112519985.98 |
| 1.99648406738489e-05 | 80707512.541 | 96127170.034 | 111731246.245 |
| 2.00039303493212e-05 | 80159470.113 | 95462501.761 | 110947846.325 |
| 2.00430965594753e-05 | 79614972.264 | 94802246.579 | 110169751.877 |
| 2.00823394541605e-05 | 79073997.744 | 94146376.925 | 109396928.759 |
| 2.01216591835193e-05 | 78536525.415 | 93494865.394 | 108629343.033 |
| 2.01610558979883e-05 | 78002534.251 | 92847684.734 | 107866960.961 |
| 2.02005297482988e-05 | 77472003.335 | 92204807.849 | 107109749.007 |
| 2.02400808854768e-05 | 76944911.861 | 91566207.796 | 106357673.833 |
| 2.02797094608445e-05 | 76421239.133 | 90931857.782 | 105610702.301 |
| 2.03194156260199e-05 | 75900964.563 | 90301731.17 | 104868801.469 |
| 2.03591995329182e-05 | 75384067.674 | 89675801.471 | 104131938.591 |
| 2.03990613337519e-05 | 74870528.094 | 89054042.348 | 103400081.119 |
| 2.04390011810316e-05 | 74360325.562 | 88436427.614 | 102673196.697 |
| 2.04790192275663e-05 | 73853439.924 | 87822931.229 | 101951253.163 |
| 2.05191156264644e-05 | 73349851.132 | 87213527.305 | 101234218.547 |
| 2.05592905311341e-05 | 72849539.245 | 86608190.098 | 100522061.071 |
| 2.05995440952838e-05 | 72352484.429 | 86006894.014 | 99814749.147 |
| 2.06398764729229e-05 | 71858666.955 | 85409613.603 | 99112251.377 |
| 2.06802878183624e-05 | 71368067.201 | 84816323.562 | 98414536.55 |
| 2.07207782862153e-05 | 70880665.648 | 84226998.733 | 97721573.644 |
| 2.07613480313975e-05 | 70396442.881 | 83641614.102 | 97033331.822 |
| 2.08019972091281e-05 | 69915379.593 | 83060144.797 | 96349780.433 |
| 2.08427259749302e-05 | 69437456.577 | 82482566.092 | 95670889.01 |
| 2.08835344846312e-05 | 68962654.731 | 81908853.4 | 94996627.272 |
| 2.09244228943638e-05 | 68490955.054 | 81338982.278 | 94326965.117 |
| 2.09653913605664e-05 | 68022338.651 | 80772928.422 | 93661872.627 |
| 2.10064400399835e-05 | 67556786.725 | 80210667.669 | 93001320.063 |
| 2.10475690896667e-05 | 67094280.582 | 79652175.996 | 92345277.867 |
| 2.10887786669749e-05 | 66634801.632 | 79097429.518 | 91693716.659 |
| 2.11300689295754e-05 | 66178331.381 | 78546404.488 | 91046607.237 |
| 2.11714400354438e-05 | 65724851.44 | 77999077.297 | 90403920.575 |
| 2.12128921428654e-05 | 65274343.515 | 77455424.473 | 89765627.824 |
| 2.12544254104351e-05 | 64826789.415 | 76915422.679 | 89131700.31 |
| 2.12960399970585e-05 | 64382171.048 | 76379048.714 | 88502109.532 |
| 2.13377360619522e-05 | 63940470.419 | 75846279.513 | 87876827.163 |
| 2.13795137646447e-05 | 63501669.633 | 75317092.143 | 87255825.047 |
| 2.14213732649768e-05 | 63065750.89 | 74791463.806 | 86639075.201 |
| 2.1463314723102e-05 | 62632696.49 | 74269371.836 | 86026549.811 |
| 2.15053382994877e-05 | 62202488.829 | 73750793.7 | 85418221.232 |
| 2.15474441549153e-05 | 61775110.401 | 73235706.997 | 84814061.99 |
| 2.15896324504812e-05 | 61350543.793 | 72724089.454 | 84214044.775 |
| 2.16319033475969e-05 | 60928771.69 | 72215918.932 | 83618142.446 |
| 2.16742570079901e-05 | 60509776.873 | 71711173.418 | 83026328.028 |
| 2.17166935937053e-05 | 60093542.216 | 71209831.031 | 82438574.709 |
| 2.1759213267104e-05 | 59680050.689 | 70711870.016 | 81854855.844 |
| 2.18018161908658e-05 | 59269285.354 | 70217268.747 | 81275144.947 |
| 2.18445025279886e-05 | 58861229.368 | 69726005.724 | 80699415.699 |
| 2.18872724417897e-05 | 58455865.983 | 69238059.575 | 80127641.937 |
| 2.1930126095906e-05 | 58053178.54 | 68753409.053 | 79559797.664 |
| 2.19730636542947e-05 | 57653150.476 | 68272033.034 | 78995857.039 |
| 2.20160852812343e-05 | 57255765.318 | 67793910.521 | 78435794.38 |
| 2.20591911413247e-05 | 56861006.685 | 67319020.641 | 77879584.163 |
| 2.21023813994882e-05 | 56468858.287 | 66847342.643 | 77327201.024 |
| 2.21456562209699e-05 | 56079303.926 | 66378855.898 | 76778619.75 |
| 2.21890157713385e-05 | 55692327.493 | 65913539.9 | 76233815.288 |
| 2.22324602164868e-05 | 55307912.969 | 65451374.265 | 75692762.736 |
| 2.22759897226327e-05 | 54926044.425 | 64992338.73 | 75155437.347 |
| 2.23196044563191e-05 | 54546706.022 | 64536413.149 | 74621814.527 |
| 2.23633045844154e-05 | 54169882.009 | 64083577.498 | 74091869.834 |
| 2.24070902741173e-05 | 53795556.722 | 63633811.873 | 73565578.976 |
| 2.24509616929481e-05 | 53423714.588 | 63187096.485 | 73042917.812 |
| 2.24949190087592e-05 | 53054340.118 | 62743411.666 | 72523862.35 |
| 2.25389623897304e-05 | 52687417.914 | 62302737.864 | 72008388.748 |
| 2.2583092004371e-05 | 52322932.662 | 61865055.641 | 71496473.309 |
| 2.262730802152e-05 | 51960869.134 | 61430345.678 | 70988092.485 |
| 2.26716106103471e-05 | 51601212.191 | 60998588.771 | 70483222.874 |
| 2.27159999403533e-05 | 51243946.777 | 60569765.829 | 69981841.218 |
| 2.27604761813714e-05 | 50889057.921 | 60143857.877 | 69483924.406 |
| 2.28050395035666e-05 | 50536530.738 | 59720846.051 | 68989449.468 |
| 2.28496900774375e-05 | 50186350.428 | 59300711.603 | 68498393.577 |
| 2.28944280738162e-05 | 49838502.274 | 58883435.895 | 68010734.051 |
| 2.29392536638697e-05 | 49492971.642 | 58469000.402 | 67526448.347 |
| 2.29841670190999e-05 | 49149743.981 | 58057386.709 | 67045514.062 |
| 2.30291683113443e-05 | 48808804.825 | 57648576.512 | 66567908.933 |
| 2.30742577127772e-05 | 48470139.789 | 57242551.619 | 66093610.838 |
| 2.31194353959099e-05 | 48133734.57 | 56839293.944 | 65622597.791 |
| 2.31647015335912e-05 | 47799574.947 | 56438785.512 | 65154847.944 |
| 2.32100562990088e-05 | 47467646.78 | 56041008.455 | 64690339.586 |
| 2.3255499865689e-05 | 47137936.01 | 55645945.016 | 64229051.141 |
| 2.33010324074982e-05 | 46810428.658 | 55253577.54 | 63770961.169 |
| 2.33466540986431e-05 | 46485110.826 | 54863888.482 | 63316048.363 |
| 2.33923651136714e-05 | 46161968.696 | 54476860.403 | 62864291.55 |
| 2.34381656274726e-05 | 45840988.529 | 54092475.968 | 62415669.692 |
| 2.34840558152789e-05 | 45522156.663 | 53710717.948 | 61970161.88 |
| 2.3530035852665e-05 | 45205459.518 | 53331569.217 | 61527747.338 |
| 2.357610591555e-05 | 44890883.59 | 52955012.755 | 61088405.419 |
| 2.3622266180197e-05 | 44578415.454 | 52581031.643 | 60652115.608 |
| 2.36685168232143e-05 | 44268041.761 | 52209609.066 | 60218857.517 |
| 2.37148580215561e-05 | 43959749.24 | 51840728.311 | 59788610.888 |
| 2.37612899525231e-05 | 43653524.698 | 51474372.765 | 59361355.589 |
| 2.38078127937629e-05 | 43349355.016 | 51110525.919 | 58937071.616 |
| 2.38544267232711e-05 | 43047227.153 | 50749171.362 | 58515739.091 |
| 2.39011319193918e-05 | 42747128.142 | 50390292.783 | 58097338.261 |
| 2.39479285608182e-05 | 42449045.092 | 50033873.973 | 57681849.498 |
| 2.39948168265935e-05 | 42152965.187 | 49679898.819 | 57269253.299 |
| 2.40417968961113e-05 | 41858875.685 | 49328351.308 | 56859530.281 |
| 2.40888689491165e-05 | 41566763.92 | 48979215.523 | 56452661.187 |
| 2.4136033165706e-05 | 41276617.297 | 48632475.647 | 56048626.881 |
| 2.41832897263291e-05 | 40988423.295 | 48288115.959 | 55647408.348 |
| 2.42306388117888e-05 | 40702169.469 | 47946120.831 | 55248986.692 |
| 2.42780806032417e-05 | 40417843.443 | 47606474.736 | 54853343.139 |
| 2.43256152821993e-05 | 40135432.915 | 47269162.238 | 54460459.033 |
| 2.43732430305285e-05 | 39854925.655 | 46934167.997 | 54070315.836 |
| 2.4420964030452e-05 | 39576309.504 | 46601476.769 | 53682895.129 |
| 2.44687784645498e-05 | 39299572.375 | 46271073.4 | 53298178.609 |
| 2.45166865157588e-05 | 39024702.252 | 45942942.833 | 52916148.09 |
| 2.45646883673745e-05 | 38751687.189 | 45617070.101 | 52536785.5 |
| 2.46127842030511e-05 | 38480515.31 | 45293440.33 | 52160072.884 |
| 2.46609742068024e-05 | 38211174.809 | 44972038.737 | 51785992.401 |
| 2.47092585630025e-05 | 37943653.95 | 44652850.631 | 51414526.324 |
| 2.47576374563865e-05 | 37677941.067 | 44335861.412 | 51045657.036 |
| 2.48061110720512e-05 | 37414024.56 | 44021056.569 | 50679367.037 |
| 2.48546795954558e-05 | 37151892.899 | 43708421.681 | 50315638.934 |
| 2.49033432124225e-05 | 36891534.624 | 43397942.416 | 49954455.45 |
| 2.49521021091376e-05 | 36632938.34 | 43089604.531 | 49595799.414 |
| 2.50009564721517e-05 | 36376092.72 | 42783393.871 | 49239653.768 |
| 2.50499064883806e-05 | 36120986.505 | 42479296.369 | 48886001.56 |
| 2.50989523451064e-05 | 35867608.502 | 42177298.044 | 48534825.949 |
| 2.51480942299775e-05 | 35615947.584 | 41877385.004 | 48186110.2 |
| 2.519733233101e-05 | 35365992.692 | 41579543.44 | 47839837.688 |
| 2.5246666836588e-05 | 35117732.831 | 41283759.631 | 47495991.892 |
| 2.52960979354643e-05 | 34871157.071 | 40990019.941 | 47154556.396 |
| 2.53456258167616e-05 | 34626254.549 | 40698310.819 | 46815514.893 |
| 2.53952506699725e-05 | 34383014.464 | 40408618.797 | 46478851.179 |
| 2.5444972684961e-05 | 34141426.082 | 40120930.491 | 46144549.152 |
| 2.54947920519625e-05 | 33901478.732 | 39835232.603 | 45812592.815 |
| 2.5544708961585e-05 | 33663161.806 | 39551511.915 | 45482966.277 |
| 2.55947236048098e-05 | 33426464.761 | 39269755.291 | 45155653.743 |
| 2.5644836172992e-05 | 33191377.115 | 38989949.68 | 44830639.525 |
| 2.56950468578614e-05 | 32957888.45 | 38712082.111 | 44507908.033 |
| 2.57453558515232e-05 | 32725988.411 | 38436139.693 | 44187443.779 |
| 2.57957633464587e-05 | 32495666.704 | 38162109.616 | 43869231.375 |
| 2.58462695355261e-05 | 32266913.097 | 37889979.152 | 43553255.53 |
| 2.58968746119611e-05 | 32039717.419 | 37619735.651 | 43239501.054 |
| 2.59475787693779e-05 | 31814069.561 | 37351366.542 | 42927952.855 |
| 2.59983822017697e-05 | 31589959.475 | 37084859.334 | 42618595.937 |
| 2.60492851035096e-05 | 31367377.172 | 36820201.613 | 42311415.401 |
| 2.6100287669351e-05 | 31146312.725 | 36557381.044 | 42006396.447 |
| 2.61513900944289e-05 | 30926756.264 | 36296385.37 | 41703524.367 |
| 2.62025925742604e-05 | 30708697.982 | 36037202.409 | 41402784.551 |
| 2.62538953047451e-05 | 30492128.13 | 35779820.057 | 41104162.482 |
| 2.63052984821664e-05 | 30277037.016 | 35524226.286 | 40807643.738 |
| 2.6356802303192e-05 | 30063415.009 | 35270409.143 | 40513213.99 |
| 2.64084069648745e-05 | 29851252.535 | 35018356.752 | 40220859.003 |
| 2.64601126646525e-05 | 29640540.078 | 34768057.31 | 39930564.632 |
| 2.65119196003511e-05 | 29431268.181 | 34519499.089 | 39642316.827 |
| 2.65638279701826e-05 | 29223427.443 | 34272670.436 | 39356101.626 |
| 2.66158379727476e-05 | 29017008.52 | 34027559.769 | 39071905.16 |
| 2.66679498070354e-05 | 28812002.125 | 33784155.583 | 38789713.649 |
| 2.6720163672425e-05 | 28608399.028 | 33542446.443 | 38509513.403 |
| 2.67724797686856e-05 | 28406190.054 | 33302420.986 | 38231290.823 |
| 2.68248982959778e-05 | 28205366.085 | 33064067.922 | 37955032.394 |
| 2.68774194548539e-05 | 28005918.058 | 32827376.034 | 37680724.694 |
| 2.69300434462589e-05 | 27807836.966 | 32592334.173 | 37408354.384 |
| 2.69827704715313e-05 | 27611113.855 | 32358931.262 | 37137908.217 |
| 2.70356007324037e-05 | 27415739.827 | 32127156.295 | 36869373.027 |
| 2.70885344310038e-05 | 27221706.039 | 31896998.335 | 36602735.738 |
| 2.7141571769855e-05 | 27029003.701 | 31668446.514 | 36337983.358 |
| 2.71947129518771e-05 | 26837624.077 | 31441490.035 | 36075102.979 |
| 2.72479581803874e-05 | 26647558.484 | 31216118.168 | 35814081.778 |
| 2.73013076591013e-05 | 26458798.293 | 30992320.251 | 35554907.017 |
| 2.73547615921327e-05 | 26271334.928 | 30770085.69 | 35297566.04 |
| 2.74083201839956e-05 | 26085159.865 | 30549403.961 | 35042046.274 |
| 2.74619836396042e-05 | 25900264.632 | 30330264.603 | 34788335.228 |
| 2.75157521642739e-05 | 25716640.811 | 30112657.225 | 34536420.494 |
| 2.75696259637221e-05 | 25534280.032 | 29896571.5 | 34286289.745 |
| 2.76236052440689e-05 | 25353173.98 | 29681997.168 | 34037930.733 |
| 2.76776902118383e-05 | 25173314.39 | 29468924.035 | 33791331.293 |
| 2.77318810739583e-05 | 24994693.048 | 29257341.971 | 33546479.339 |
| 2.77861780377621e-05 | 24817301.79 | 29047240.912 | 33303362.862 |
| 2.78405813109891e-05 | 24641132.504 | 28838610.856 | 33061969.936 |
| 2.78950911017851e-05 | 24466177.125 | 28631441.869 | 32822288.71 |
| 2.79497076187036e-05 | 24292427.64 | 28425724.076 | 32584307.412 |
| 2.80044310707065e-05 | 24119876.087 | 28221447.669 | 32348014.349 |
| 2.80592616671647e-05 | 23948514.55 | 28018602.901 | 32113397.903 |
| 2.81141996178591e-05 | 23778335.163 | 27817180.088 | 31880446.532 |
| 2.81692451329814e-05 | 23609330.111 | 27617169.608 | 31649148.771 |
| 2.82243984231346e-05 | 23441491.623 | 27418561.901 | 31419493.232 |
| 2.82796596993343e-05 | 23274811.981 | 27221347.468 | 31191468.6 |
| 2.83350291730092e-05 | 23109283.512 | 27025516.871 | 30965063.635 |
| 2.83905070560019e-05 | 22944898.591 | 26831060.734 | 30740267.172 |
| 2.84460935605698e-05 | 22781649.641 | 26637969.739 | 30517068.119 |
| 2.85017888993858e-05 | 22619529.13 | 26446234.63 | 30295455.456 |
| 2.85575932855393e-05 | 22458529.578 | 26255846.21 | 30075418.239 |
| 2.86135069325369e-05 | 22298643.545 | 26066795.341 | 29856945.594 |
| 2.86695300543033e-05 | 22139863.642 | 25879072.943 | 29640026.719 |
| 2.87256628651819e-05 | 21982182.524 | 25692669.998 | 29424650.885 |
| 2.87819055799358e-05 | 21825592.893 | 25507577.542 | 29210807.431 |
| 2.88382584137487e-05 | 21670087.495 | 25323786.671 | 28998485.77 |
| 2.88947215822255e-05 | 21515659.123 | 25141288.538 | 28787675.382 |
| 2.89512953013932e-05 | 21362300.613 | 24960074.355 | 28578365.82 |
| 2.9007979787702e-05 | 21210004.849 | 24780135.387 | 28370546.704 |
| 2.90647752580257e-05 | 21058764.756 | 24601462.959 | 28164207.723 |
| 2.91216819296627e-05 | 20908573.306 | 24424048.451 | 27959338.635 |
| 2.91787000203369e-05 | 20759423.512 | 24247883.299 | 27755929.266 |
| 2.92358297481986e-05 | 20611308.434 | 24072958.993 | 27553969.509 |
| 2.9293071331825e-05 | 20464221.174 | 23899267.08 | 27353449.324 |
| 2.93504249902215e-05 | 20318154.878 | 23726799.162 | 27154358.739 |
| 2.94078909428221e-05 | 20173102.733 | 23555546.894 | 26956687.847 |
| 2.94654694094906e-05 | 20029057.971 | 23385501.986 | 26760426.808 |
| 2.9523160610521e-05 | 19886013.866 | 23216656.202 | 26565565.846 |
| 2.9580964766639e-05 | 19743963.734 | 23049001.358 | 26372095.251 |
| 2.96388820990022e-05 | 19602900.933 | 22882529.326 | 26180005.378 |
| 2.96969128292013e-05 | 19462818.863 | 22717232.029 | 25989286.646 |
| 2.97550571792608e-05 | 19323710.967 | 22553101.443 | 25799929.538 |
| 2.981331537164e-05 | 19185570.726 | 22390129.596 | 25611924.599 |
| 2.98716876292337e-05 | 19048391.665 | 22228308.567 | 25425262.438 |
| 2.99301741753731e-05 | 18912167.349 | 22067630.49 | 25239933.728 |
| 2.99887752338267e-05 | 18776891.384 | 21908087.546 | 25055929.203 |
| 3.00474910288011e-05 | 18642557.415 | 21749671.971 | 24873239.659 |
| 3.01063217849418e-05 | 18509159.129 | 21592376.047 | 24691855.952 |
| 3.01652677273344e-05 | 18376690.253 | 21436192.112 | 24511769.003 |
| 3.0224329081505e-05 | 18245144.551 | 21281112.549 | 24332969.789 |
| 3.02835060734211e-05 | 18114515.829 | 21127129.794 | 24155449.352 |
| 3.03427989294931e-05 | 17984797.932 | 20974236.331 | 23979198.789 |
| 3.04022078765742e-05 | 17855984.744 | 20822424.694 | 23804209.261 |
| 3.0461733141962e-05 | 17728070.188 | 20671687.465 | 23630471.986 |
| 3.05213749533992e-05 | 17601048.223 | 20522017.276 | 23457978.241 |
| 3.05811335390742e-05 | 17474912.85 | 20373406.805 | 23286719.362 |
| 3.06410091276224e-05 | 17349658.107 | 20225848.779 | 23116686.743 |
| 3.07010019481267e-05 | 17225278.068 | 20079335.974 | 22947871.834 |
| 3.07611122301185e-05 | 17101766.848 | 19933861.213 | 22780266.145 |
| 3.08213402035788e-05 | 16979118.596 | 19789417.364 | 22613861.242 |
| 3.08816860989386e-05 | 16857327.502 | 19645997.343 | 22448648.746 |
| 3.09421501470803e-05 | 16736387.789 | 19503594.115 | 22284620.338 |
| 3.10027325793382e-05 | 16616293.719 | 19362200.687 | 22121767.751 |
| 3.10634336274998e-05 | 16497039.592 | 19221810.115 | 21960082.775 |
| 3.1124253523806e-05 | 16378619.742 | 19082415.499 | 21799557.257 |
| 3.11851925009528e-05 | 16261028.54 | 18944009.986 | 21640183.095 |
| 3.12462507920916e-05 | 16144260.394 | 18806586.767 | 21481952.246 |
| 3.13074286308304e-05 | 16028309.745 | 18670139.077 | 21324856.717 |
| 3.13687262512343e-05 | 15913171.073 | 18534660.199 | 21168888.572 |
| 3.14301438878272e-05 | 15798838.891 | 18400143.455 | 21014039.927 |
| 3.14916817755916e-05 | 15685307.748 | 18266582.217 | 20860302.951 |
| 3.15533401499706e-05 | 15572572.227 | 18133969.895 | 20707669.866 |
| 3.16151192468679e-05 | 15460626.949 | 18002299.947 | 20556132.947 |
| 3.16770193026494e-05 | 15349466.564 | 17871565.872 | 20405684.521 |
| 3.17390405541434e-05 | 15239085.762 | 17741761.212 | 20256316.966 |
| 3.18011832386421e-05 | 15129479.263 | 17612879.552 | 20108022.712 |
| 3.18634475939025e-05 | 15020641.822 | 17484914.521 | 19960794.24 |
| 3.19258338581469e-05 | 14912568.23 | 17357859.787 | 19814624.082 |
| 3.19883422700638e-05 | 14805253.309 | 17231709.061 | 19669504.821 |
| 3.20509730688095e-05 | 14698691.914 | 17106456.098 | 19525429.088 |
| 3.21137264940083e-05 | 14592878.935 | 16982094.692 | 19382389.567 |
| 3.21766027857536e-05 | 14487809.293 | 16858618.678 | 19240378.989 |
| 3.2239602184609e-05 | 14383477.945 | 16736021.933 | 19099390.136 |
| 3.2302724931609e-05 | 14279879.876 | 16614298.374 | 18959415.837 |
| 3.23659712682603e-05 | 14177010.108 | 16493441.959 | 18820448.97 |
| 3.24293414365422e-05 | 14074863.69 | 16373446.685 | 18682482.463 |
| 3.24928356789077e-05 | 13973435.708 | 16254306.589 | 18545509.29 |
| 3.25564542382848e-05 | 13872721.277 | 16136015.75 | 18409522.474 |
| 3.26201973580769e-05 | 13772715.544 | 16018568.282 | 18274515.085 |
| 3.26840652821641e-05 | 13673413.688 | 15901958.343 | 18140480.238 |
| 3.27480582549039e-05 | 13574810.918 | 15786180.125 | 18007411.098 |
| 3.28121765211322e-05 | 13476902.475 | 15671227.863 | 17875300.874 |
| 3.28764203261645e-05 | 13379683.631 | 15557095.827 | 17744142.822 |
| 3.29407899157963e-05 | 13283149.687 | 15443778.328 | 17613930.245 |
| 3.30052855363046e-05 | 13187295.978 | 15331269.713 | 17484656.489 |
| 3.30699074344485e-05 | 13092117.865 | 15219564.366 | 17356314.947 |
| 3.31346558574703e-05 | 12997610.742 | 15108656.712 | 17228899.057 |
| 3.31995310530961e-05 | 12903770.032 | 14998541.209 | 17102402.3 |
| 3.32645332695374e-05 | 12810591.187 | 14889212.354 | 16976818.204 |
| 3.33296627554916e-05 | 12718069.691 | 14780664.681 | 16852140.338 |
| 3.33949197601427e-05 | 12626201.054 | 14672892.76 | 16728362.318 |
| 3.34603045331631e-05 | 12534980.817 | 14565891.198 | 16605477.801 |
| 3.35258173247137e-05 | 12444404.551 | 14459654.635 | 16483480.488 |
| 3.35914583854452e-05 | 12354467.855 | 14354177.752 | 16362364.123 |
| 3.36572279664991e-05 | 12265166.355 | 14249455.261 | 16242122.494 |
| 3.37231263195088e-05 | 12176495.709 | 14145481.912 | 16122749.428 |
| 3.37891536966002e-05 | 12088451.599 | 14042252.49 | 16004238.799 |
| 3.38553103503928e-05 | 12001029.739 | 13939761.812 | 15886584.517 |
| 3.39215965340008e-05 | 11914225.87 | 13838004.734 | 15769780.539 |
| 3.3988012501034e-05 | 11828035.759 | 13736976.143 | 15653820.86 |
| 3.40545585055985e-05 | 11742455.202 | 13636670.963 | 15538699.517 |
| 3.41212348022985e-05 | 11657480.024 | 13537084.15 | 15424410.588 |
| 3.4188041646236e-05 | 11573106.074 | 13438210.695 | 15310948.191 |
| 3.4254979293013e-05 | 11489329.231 | 13340045.621 | 15198306.485 |
| 3.43220479987317e-05 | 11406145.399 | 13242583.988 | 15086479.667 |
| 3.43892480199957e-05 | 11323550.511 | 13145820.885 | 14975461.977 |
| 3.44565796139111e-05 | 11241540.525 | 13049751.436 | 14865247.692 |
| 3.45240430380875e-05 | 11160111.425 | 12954370.798 | 14755831.128 |
| 3.45916385506386e-05 | 11079259.224 | 12859674.16 | 14647206.641 |
| 3.46593664101838e-05 | 10998979.958 | 12765656.744 | 14539368.626 |
| 3.47272268758485e-05 | 10919269.69 | 12672313.803 | 14432311.515 |
| 3.47952202072658e-05 | 10840124.511 | 12579640.623 | 14326029.78 |
| 3.48633466645768e-05 | 10761540.535 | 12487632.521 | 14220517.93 |
| 3.49316065084323e-05 | 10683513.903 | 12396284.847 | 14115770.51 |
| 3.49999999999932e-05 | 10606040.78 | 12305592.98 | 14011782.106 |